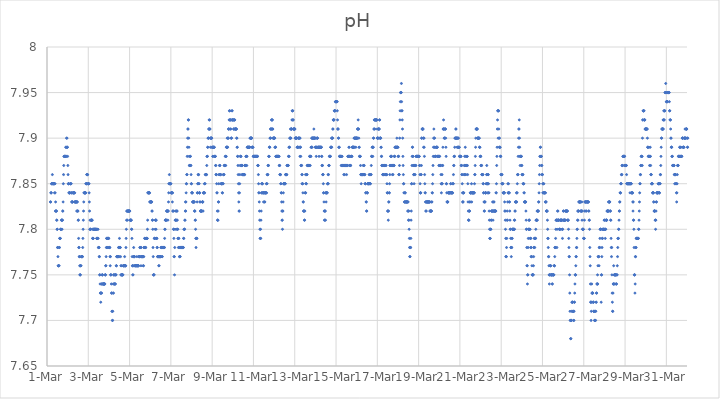
| Category | pH |
|---|---|
| 44986.166666666664 | 7.83 |
| 44986.177083333336 | 7.83 |
| 44986.1875 | 7.84 |
| 44986.197916666664 | 7.84 |
| 44986.208333333336 | 7.84 |
| 44986.21875 | 7.85 |
| 44986.229166666664 | 7.85 |
| 44986.239583333336 | 7.85 |
| 44986.25 | 7.85 |
| 44986.260416666664 | 7.86 |
| 44986.270833333336 | 7.85 |
| 44986.28125 | 7.85 |
| 44986.291666666664 | 7.85 |
| 44986.302083333336 | 7.85 |
| 44986.3125 | 7.85 |
| 44986.322916666664 | 7.85 |
| 44986.333333333336 | 7.85 |
| 44986.34375 | 7.85 |
| 44986.354166666664 | 7.85 |
| 44986.364583333336 | 7.84 |
| 44986.375 | 7.85 |
| 44986.385416666664 | 7.85 |
| 44986.395833333336 | 7.84 |
| 44986.40625 | 7.82 |
| 44986.416666666664 | 7.83 |
| 44986.427083333336 | 7.82 |
| 44986.4375 | 7.82 |
| 44986.447916666664 | 7.82 |
| 44986.458333333336 | 7.82 |
| 44986.46875 | 7.81 |
| 44986.479166666664 | 7.81 |
| 44986.489583333336 | 7.8 |
| 44986.5 | 7.8 |
| 44986.510416666664 | 7.78 |
| 44986.520833333336 | 7.78 |
| 44986.53125 | 7.77 |
| 44986.541666666664 | 7.76 |
| 44986.552083333336 | 7.76 |
| 44986.5625 | 7.76 |
| 44986.572916666664 | 7.76 |
| 44986.583333333336 | 7.76 |
| 44986.59375 | 7.78 |
| 44986.604166666664 | 7.78 |
| 44986.614583333336 | 7.79 |
| 44986.625 | 7.79 |
| 44986.635416666664 | 7.79 |
| 44986.645833333336 | 7.79 |
| 44986.65625 | 7.8 |
| 44986.666666666664 | 7.8 |
| 44986.677083333336 | 7.8 |
| 44986.6875 | 7.8 |
| 44986.697916666664 | 7.81 |
| 44986.708333333336 | 7.81 |
| 44986.71875 | 7.81 |
| 44986.729166666664 | 7.8 |
| 44986.739583333336 | 7.81 |
| 44986.75 | 7.81 |
| 44986.760416666664 | 7.82 |
| 44986.770833333336 | 7.82 |
| 44986.78125 | 7.83 |
| 44986.791666666664 | 7.85 |
| 44986.802083333336 | 7.86 |
| 44986.8125 | 7.87 |
| 44986.822916666664 | 7.88 |
| 44986.833333333336 | 7.88 |
| 44986.84375 | 7.88 |
| 44986.854166666664 | 7.88 |
| 44986.864583333336 | 7.88 |
| 44986.875 | 7.88 |
| 44986.885416666664 | 7.88 |
| 44986.895833333336 | 7.88 |
| 44986.90625 | 7.89 |
| 44986.916666666664 | 7.88 |
| 44986.927083333336 | 7.89 |
| 44986.9375 | 7.88 |
| 44986.947916666664 | 7.9 |
| 44986.958333333336 | 7.89 |
| 44986.96875 | 7.9 |
| 44986.979166666664 | 7.89 |
| 44986.989583333336 | 7.89 |
| 44987.0 | 7.88 |
| 44987.010416666664 | 7.87 |
| 44987.020833333336 | 7.86 |
| 44987.03125 | 7.85 |
| 44987.041666666664 | 7.85 |
| 44987.052083333336 | 7.85 |
| 44987.0625 | 7.84 |
| 44987.072916666664 | 7.84 |
| 44987.083333333336 | 7.84 |
| 44987.09375 | 7.84 |
| 44987.104166666664 | 7.84 |
| 44987.114583333336 | 7.84 |
| 44987.125 | 7.85 |
| 44987.135416666664 | 7.85 |
| 44987.145833333336 | 7.85 |
| 44987.15625 | 7.85 |
| 44987.166666666664 | 7.85 |
| 44987.177083333336 | 7.84 |
| 44987.1875 | 7.84 |
| 44987.197916666664 | 7.83 |
| 44987.208333333336 | 7.83 |
| 44987.21875 | 7.83 |
| 44987.229166666664 | 7.83 |
| 44987.239583333336 | 7.83 |
| 44987.25 | 7.84 |
| 44987.260416666664 | 7.84 |
| 44987.270833333336 | 7.84 |
| 44987.28125 | 7.84 |
| 44987.291666666664 | 7.84 |
| 44987.302083333336 | 7.84 |
| 44987.3125 | 7.84 |
| 44987.322916666664 | 7.84 |
| 44987.333333333336 | 7.83 |
| 44987.34375 | 7.84 |
| 44987.354166666664 | 7.83 |
| 44987.364583333336 | 7.83 |
| 44987.375 | 7.83 |
| 44987.385416666664 | 7.83 |
| 44987.395833333336 | 7.83 |
| 44987.40625 | 7.83 |
| 44987.416666666664 | 7.83 |
| 44987.427083333336 | 7.83 |
| 44987.4375 | 7.82 |
| 44987.447916666664 | 7.83 |
| 44987.458333333336 | 7.83 |
| 44987.46875 | 7.83 |
| 44987.479166666664 | 7.82 |
| 44987.489583333336 | 7.82 |
| 44987.5 | 7.82 |
| 44987.510416666664 | 7.81 |
| 44987.520833333336 | 7.81 |
| 44987.53125 | 7.79 |
| 44987.541666666664 | 7.78 |
| 44987.552083333336 | 7.78 |
| 44987.5625 | 7.77 |
| 44987.572916666664 | 7.77 |
| 44987.583333333336 | 7.76 |
| 44987.59375 | 7.75 |
| 44987.604166666664 | 7.75 |
| 44987.614583333336 | 7.75 |
| 44987.625 | 7.76 |
| 44987.635416666664 | 7.76 |
| 44987.645833333336 | 7.76 |
| 44987.65625 | 7.77 |
| 44987.666666666664 | 7.77 |
| 44987.677083333336 | 7.77 |
| 44987.6875 | 7.77 |
| 44987.697916666664 | 7.77 |
| 44987.708333333336 | 7.77 |
| 44987.71875 | 7.77 |
| 44987.729166666664 | 7.78 |
| 44987.739583333336 | 7.79 |
| 44987.75 | 7.8 |
| 44987.760416666664 | 7.81 |
| 44987.770833333336 | 7.82 |
| 44987.78125 | 7.83 |
| 44987.791666666664 | 7.84 |
| 44987.802083333336 | 7.84 |
| 44987.8125 | 7.84 |
| 44987.822916666664 | 7.84 |
| 44987.833333333336 | 7.84 |
| 44987.84375 | 7.84 |
| 44987.854166666664 | 7.84 |
| 44987.864583333336 | 7.84 |
| 44987.875 | 7.84 |
| 44987.885416666664 | 7.85 |
| 44987.895833333336 | 7.85 |
| 44987.90625 | 7.85 |
| 44987.916666666664 | 7.85 |
| 44987.927083333336 | 7.86 |
| 44987.9375 | 7.86 |
| 44987.947916666664 | 7.86 |
| 44987.958333333336 | 7.86 |
| 44987.96875 | 7.86 |
| 44987.979166666664 | 7.85 |
| 44987.989583333336 | 7.85 |
| 44988.0 | 7.85 |
| 44988.010416666664 | 7.85 |
| 44988.020833333336 | 7.85 |
| 44988.03125 | 7.85 |
| 44988.041666666664 | 7.84 |
| 44988.052083333336 | 7.83 |
| 44988.0625 | 7.82 |
| 44988.072916666664 | 7.8 |
| 44988.083333333336 | 7.81 |
| 44988.09375 | 7.8 |
| 44988.104166666664 | 7.8 |
| 44988.114583333336 | 7.8 |
| 44988.125 | 7.81 |
| 44988.135416666664 | 7.81 |
| 44988.145833333336 | 7.81 |
| 44988.15625 | 7.81 |
| 44988.166666666664 | 7.81 |
| 44988.177083333336 | 7.81 |
| 44988.1875 | 7.81 |
| 44988.197916666664 | 7.8 |
| 44988.208333333336 | 7.79 |
| 44988.21875 | 7.79 |
| 44988.229166666664 | 7.79 |
| 44988.239583333336 | 7.79 |
| 44988.25 | 7.8 |
| 44988.260416666664 | 7.8 |
| 44988.270833333336 | 7.8 |
| 44988.28125 | 7.8 |
| 44988.291666666664 | 7.8 |
| 44988.302083333336 | 7.8 |
| 44988.3125 | 7.8 |
| 44988.322916666664 | 7.8 |
| 44988.333333333336 | 7.8 |
| 44988.34375 | 7.8 |
| 44988.354166666664 | 7.8 |
| 44988.364583333336 | 7.8 |
| 44988.375 | 7.8 |
| 44988.385416666664 | 7.8 |
| 44988.395833333336 | 7.8 |
| 44988.40625 | 7.79 |
| 44988.416666666664 | 7.79 |
| 44988.427083333336 | 7.79 |
| 44988.4375 | 7.79 |
| 44988.447916666664 | 7.79 |
| 44988.458333333336 | 7.8 |
| 44988.46875 | 7.8 |
| 44988.479166666664 | 7.79 |
| 44988.489583333336 | 7.78 |
| 44988.5 | 7.78 |
| 44988.510416666664 | 7.78 |
| 44988.520833333336 | 7.78 |
| 44988.53125 | 7.77 |
| 44988.541666666664 | 7.77 |
| 44988.552083333336 | 7.75 |
| 44988.5625 | 7.75 |
| 44988.572916666664 | 7.74 |
| 44988.583333333336 | 7.73 |
| 44988.59375 | 7.73 |
| 44988.604166666664 | 7.72 |
| 44988.614583333336 | 7.73 |
| 44988.625 | 7.73 |
| 44988.635416666664 | 7.74 |
| 44988.645833333336 | 7.73 |
| 44988.65625 | 7.74 |
| 44988.666666666664 | 7.75 |
| 44988.677083333336 | 7.75 |
| 44988.6875 | 7.75 |
| 44988.697916666664 | 7.74 |
| 44988.708333333336 | 7.74 |
| 44988.71875 | 7.74 |
| 44988.729166666664 | 7.74 |
| 44988.739583333336 | 7.74 |
| 44988.75 | 7.74 |
| 44988.760416666664 | 7.74 |
| 44988.770833333336 | 7.74 |
| 44988.78125 | 7.74 |
| 44988.791666666664 | 7.74 |
| 44988.802083333336 | 7.74 |
| 44988.8125 | 7.75 |
| 44988.822916666664 | 7.75 |
| 44988.833333333336 | 7.75 |
| 44988.84375 | 7.76 |
| 44988.854166666664 | 7.76 |
| 44988.864583333336 | 7.77 |
| 44988.875 | 7.78 |
| 44988.885416666664 | 7.79 |
| 44988.895833333336 | 7.79 |
| 44988.90625 | 7.78 |
| 44988.916666666664 | 7.78 |
| 44988.927083333336 | 7.79 |
| 44988.9375 | 7.79 |
| 44988.947916666664 | 7.79 |
| 44988.958333333336 | 7.79 |
| 44988.96875 | 7.79 |
| 44988.979166666664 | 7.79 |
| 44988.989583333336 | 7.79 |
| 44989.0 | 7.78 |
| 44989.010416666664 | 7.78 |
| 44989.020833333336 | 7.78 |
| 44989.03125 | 7.78 |
| 44989.041666666664 | 7.78 |
| 44989.052083333336 | 7.77 |
| 44989.0625 | 7.76 |
| 44989.072916666664 | 7.77 |
| 44989.083333333336 | 7.75 |
| 44989.09375 | 7.75 |
| 44989.104166666664 | 7.75 |
| 44989.114583333336 | 7.74 |
| 44989.125 | 7.73 |
| 44989.135416666664 | 7.73 |
| 44989.145833333336 | 7.71 |
| 44989.15625 | 7.71 |
| 44989.166666666664 | 7.7 |
| 44989.177083333336 | 7.7 |
| 44989.1875 | 7.71 |
| 44989.197916666664 | 7.73 |
| 44989.208333333336 | 7.74 |
| 44989.21875 | 7.73 |
| 44989.229166666664 | 7.75 |
| 44989.239583333336 | 7.75 |
| 44989.25 | 7.74 |
| 44989.260416666664 | 7.74 |
| 44989.270833333336 | 7.74 |
| 44989.28125 | 7.75 |
| 44989.291666666664 | 7.75 |
| 44989.302083333336 | 7.74 |
| 44989.3125 | 7.74 |
| 44989.322916666664 | 7.75 |
| 44989.333333333336 | 7.75 |
| 44989.34375 | 7.75 |
| 44989.354166666664 | 7.76 |
| 44989.364583333336 | 7.76 |
| 44989.375 | 7.77 |
| 44989.385416666664 | 7.77 |
| 44989.395833333336 | 7.77 |
| 44989.40625 | 7.77 |
| 44989.416666666664 | 7.77 |
| 44989.427083333336 | 7.77 |
| 44989.4375 | 7.77 |
| 44989.447916666664 | 7.77 |
| 44989.458333333336 | 7.77 |
| 44989.46875 | 7.78 |
| 44989.479166666664 | 7.78 |
| 44989.489583333336 | 7.78 |
| 44989.5 | 7.77 |
| 44989.510416666664 | 7.79 |
| 44989.520833333336 | 7.78 |
| 44989.53125 | 7.78 |
| 44989.541666666664 | 7.78 |
| 44989.552083333336 | 7.78 |
| 44989.5625 | 7.77 |
| 44989.572916666664 | 7.75 |
| 44989.583333333336 | 7.76 |
| 44989.59375 | 7.76 |
| 44989.604166666664 | 7.75 |
| 44989.614583333336 | 7.75 |
| 44989.625 | 7.75 |
| 44989.635416666664 | 7.75 |
| 44989.645833333336 | 7.75 |
| 44989.65625 | 7.75 |
| 44989.666666666664 | 7.75 |
| 44989.677083333336 | 7.75 |
| 44989.6875 | 7.76 |
| 44989.697916666664 | 7.76 |
| 44989.708333333336 | 7.76 |
| 44989.71875 | 7.76 |
| 44989.729166666664 | 7.76 |
| 44989.739583333336 | 7.76 |
| 44989.75 | 7.76 |
| 44989.760416666664 | 7.77 |
| 44989.770833333336 | 7.76 |
| 44989.78125 | 7.76 |
| 44989.791666666664 | 7.76 |
| 44989.802083333336 | 7.76 |
| 44989.8125 | 7.76 |
| 44989.822916666664 | 7.78 |
| 44989.833333333336 | 7.79 |
| 44989.84375 | 7.8 |
| 44989.854166666664 | 7.81 |
| 44989.864583333336 | 7.82 |
| 44989.875 | 7.82 |
| 44989.885416666664 | 7.82 |
| 44989.895833333336 | 7.81 |
| 44989.90625 | 7.82 |
| 44989.916666666664 | 7.82 |
| 44989.927083333336 | 7.82 |
| 44989.9375 | 7.82 |
| 44989.947916666664 | 7.82 |
| 44989.958333333336 | 7.82 |
| 44989.96875 | 7.82 |
| 44989.979166666664 | 7.82 |
| 44989.989583333336 | 7.82 |
| 44990.0 | 7.82 |
| 44990.010416666664 | 7.82 |
| 44990.020833333336 | 7.81 |
| 44990.03125 | 7.81 |
| 44990.041666666664 | 7.81 |
| 44990.052083333336 | 7.81 |
| 44990.0625 | 7.81 |
| 44990.072916666664 | 7.81 |
| 44990.083333333336 | 7.81 |
| 44990.09375 | 7.8 |
| 44990.104166666664 | 7.8 |
| 44990.114583333336 | 7.79 |
| 44990.125 | 7.77 |
| 44990.135416666664 | 7.76 |
| 44990.145833333336 | 7.76 |
| 44990.15625 | 7.75 |
| 44990.166666666664 | 7.75 |
| 44990.177083333336 | 7.76 |
| 44990.1875 | 7.77 |
| 44990.197916666664 | 7.78 |
| 44990.208333333336 | 7.77 |
| 44990.21875 | 7.77 |
| 44990.229166666664 | 7.77 |
| 44990.239583333336 | 7.77 |
| 44990.25 | 7.76 |
| 44990.260416666664 | 7.76 |
| 44990.270833333336 | 7.76 |
| 44990.28125 | 7.76 |
| 44990.291666666664 | 7.76 |
| 44990.302083333336 | 7.76 |
| 44990.3125 | 7.76 |
| 44990.322916666664 | 7.76 |
| 44990.333333333336 | 7.76 |
| 44990.34375 | 7.76 |
| 44990.354166666664 | 7.77 |
| 44990.364583333336 | 7.76 |
| 44990.375 | 7.76 |
| 44990.385416666664 | 7.76 |
| 44990.395833333336 | 7.76 |
| 44990.40625 | 7.76 |
| 44990.416666666664 | 7.76 |
| 44990.427083333336 | 7.76 |
| 44990.4375 | 7.76 |
| 44990.447916666664 | 7.77 |
| 44990.458333333336 | 7.77 |
| 44990.46875 | 7.77 |
| 44990.479166666664 | 7.77 |
| 44990.489583333336 | 7.77 |
| 44990.5 | 7.78 |
| 44990.510416666664 | 7.78 |
| 44990.520833333336 | 7.78 |
| 44990.53125 | 7.78 |
| 44990.541666666664 | 7.77 |
| 44990.552083333336 | 7.76 |
| 44990.5625 | 7.78 |
| 44990.572916666664 | 7.77 |
| 44990.583333333336 | 7.77 |
| 44990.59375 | 7.77 |
| 44990.604166666664 | 7.77 |
| 44990.614583333336 | 7.77 |
| 44990.625 | 7.77 |
| 44990.635416666664 | 7.77 |
| 44990.645833333336 | 7.77 |
| 44990.65625 | 7.76 |
| 44990.666666666664 | 7.77 |
| 44990.677083333336 | 7.76 |
| 44990.6875 | 7.77 |
| 44990.697916666664 | 7.78 |
| 44990.708333333336 | 7.78 |
| 44990.71875 | 7.78 |
| 44990.729166666664 | 7.79 |
| 44990.739583333336 | 7.79 |
| 44990.75 | 7.78 |
| 44990.760416666664 | 7.78 |
| 44990.770833333336 | 7.78 |
| 44990.78125 | 7.78 |
| 44990.791666666664 | 7.79 |
| 44990.802083333336 | 7.79 |
| 44990.8125 | 7.79 |
| 44990.822916666664 | 7.79 |
| 44990.833333333336 | 7.79 |
| 44990.84375 | 7.79 |
| 44990.854166666664 | 7.79 |
| 44990.864583333336 | 7.8 |
| 44990.875 | 7.81 |
| 44990.885416666664 | 7.84 |
| 44990.895833333336 | 7.84 |
| 44990.90625 | 7.84 |
| 44990.916666666664 | 7.84 |
| 44990.927083333336 | 7.84 |
| 44990.9375 | 7.84 |
| 44990.947916666664 | 7.84 |
| 44990.958333333336 | 7.84 |
| 44990.96875 | 7.84 |
| 44990.979166666664 | 7.83 |
| 44990.989583333336 | 7.83 |
| 44991.0 | 7.83 |
| 44991.010416666664 | 7.83 |
| 44991.020833333336 | 7.83 |
| 44991.03125 | 7.83 |
| 44991.041666666664 | 7.83 |
| 44991.052083333336 | 7.83 |
| 44991.0625 | 7.83 |
| 44991.072916666664 | 7.83 |
| 44991.083333333336 | 7.82 |
| 44991.09375 | 7.82 |
| 44991.104166666664 | 7.81 |
| 44991.114583333336 | 7.81 |
| 44991.125 | 7.8 |
| 44991.135416666664 | 7.78 |
| 44991.145833333336 | 7.77 |
| 44991.15625 | 7.75 |
| 44991.166666666664 | 7.75 |
| 44991.177083333336 | 7.75 |
| 44991.1875 | 7.75 |
| 44991.197916666664 | 7.79 |
| 44991.208333333336 | 7.79 |
| 44991.21875 | 7.79 |
| 44991.229166666664 | 7.79 |
| 44991.239583333336 | 7.8 |
| 44991.25 | 7.81 |
| 44991.260416666664 | 7.81 |
| 44991.270833333336 | 7.81 |
| 44991.28125 | 7.8 |
| 44991.291666666664 | 7.81 |
| 44991.302083333336 | 7.79 |
| 44991.3125 | 7.79 |
| 44991.322916666664 | 7.79 |
| 44991.333333333336 | 7.78 |
| 44991.34375 | 7.78 |
| 44991.354166666664 | 7.77 |
| 44991.364583333336 | 7.77 |
| 44991.375 | 7.77 |
| 44991.385416666664 | 7.77 |
| 44991.395833333336 | 7.77 |
| 44991.40625 | 7.77 |
| 44991.416666666664 | 7.76 |
| 44991.427083333336 | 7.76 |
| 44991.4375 | 7.77 |
| 44991.447916666664 | 7.77 |
| 44991.458333333336 | 7.77 |
| 44991.46875 | 7.77 |
| 44991.479166666664 | 7.77 |
| 44991.489583333336 | 7.77 |
| 44991.5 | 7.77 |
| 44991.510416666664 | 7.77 |
| 44991.520833333336 | 7.78 |
| 44991.53125 | 7.78 |
| 44991.541666666664 | 7.78 |
| 44991.552083333336 | 7.78 |
| 44991.5625 | 7.78 |
| 44991.572916666664 | 7.77 |
| 44991.583333333336 | 7.77 |
| 44991.59375 | 7.78 |
| 44991.604166666664 | 7.78 |
| 44991.614583333336 | 7.78 |
| 44991.625 | 7.78 |
| 44991.635416666664 | 7.78 |
| 44991.645833333336 | 7.78 |
| 44991.65625 | 7.78 |
| 44991.666666666664 | 7.78 |
| 44991.677083333336 | 7.78 |
| 44991.6875 | 7.78 |
| 44991.697916666664 | 7.79 |
| 44991.708333333336 | 7.8 |
| 44991.71875 | 7.8 |
| 44991.729166666664 | 7.81 |
| 44991.739583333336 | 7.81 |
| 44991.75 | 7.81 |
| 44991.760416666664 | 7.81 |
| 44991.770833333336 | 7.81 |
| 44991.78125 | 7.81 |
| 44991.791666666664 | 7.82 |
| 44991.802083333336 | 7.82 |
| 44991.8125 | 7.82 |
| 44991.822916666664 | 7.82 |
| 44991.833333333336 | 7.82 |
| 44991.84375 | 7.82 |
| 44991.854166666664 | 7.81 |
| 44991.864583333336 | 7.82 |
| 44991.875 | 7.82 |
| 44991.885416666664 | 7.83 |
| 44991.895833333336 | 7.84 |
| 44991.90625 | 7.85 |
| 44991.916666666664 | 7.85 |
| 44991.927083333336 | 7.86 |
| 44991.9375 | 7.85 |
| 44991.947916666664 | 7.85 |
| 44991.958333333336 | 7.85 |
| 44991.96875 | 7.85 |
| 44991.979166666664 | 7.85 |
| 44991.989583333336 | 7.85 |
| 44992.0 | 7.85 |
| 44992.010416666664 | 7.84 |
| 44992.020833333336 | 7.84 |
| 44992.03125 | 7.84 |
| 44992.041666666664 | 7.84 |
| 44992.052083333336 | 7.84 |
| 44992.0625 | 7.84 |
| 44992.072916666664 | 7.83 |
| 44992.083333333336 | 7.84 |
| 44992.09375 | 7.82 |
| 44992.104166666664 | 7.82 |
| 44992.114583333336 | 7.82 |
| 44992.125 | 7.8 |
| 44992.135416666664 | 7.8 |
| 44992.145833333336 | 7.79 |
| 44992.15625 | 7.77 |
| 44992.166666666664 | 7.77 |
| 44992.177083333336 | 7.75 |
| 44992.1875 | 7.78 |
| 44992.197916666664 | 7.8 |
| 44992.208333333336 | 7.81 |
| 44992.21875 | 7.82 |
| 44992.229166666664 | 7.81 |
| 44992.239583333336 | 7.81 |
| 44992.25 | 7.81 |
| 44992.260416666664 | 7.8 |
| 44992.270833333336 | 7.81 |
| 44992.28125 | 7.82 |
| 44992.291666666664 | 7.82 |
| 44992.302083333336 | 7.82 |
| 44992.3125 | 7.81 |
| 44992.322916666664 | 7.8 |
| 44992.333333333336 | 7.8 |
| 44992.34375 | 7.79 |
| 44992.354166666664 | 7.79 |
| 44992.364583333336 | 7.78 |
| 44992.375 | 7.79 |
| 44992.385416666664 | 7.79 |
| 44992.395833333336 | 7.78 |
| 44992.40625 | 7.78 |
| 44992.416666666664 | 7.77 |
| 44992.427083333336 | 7.77 |
| 44992.4375 | 7.77 |
| 44992.447916666664 | 7.77 |
| 44992.458333333336 | 7.78 |
| 44992.46875 | 7.78 |
| 44992.479166666664 | 7.78 |
| 44992.489583333336 | 7.78 |
| 44992.5 | 7.78 |
| 44992.510416666664 | 7.78 |
| 44992.520833333336 | 7.78 |
| 44992.53125 | 7.78 |
| 44992.541666666664 | 7.78 |
| 44992.552083333336 | 7.78 |
| 44992.5625 | 7.78 |
| 44992.572916666664 | 7.78 |
| 44992.583333333336 | 7.78 |
| 44992.59375 | 7.78 |
| 44992.604166666664 | 7.78 |
| 44992.614583333336 | 7.79 |
| 44992.625 | 7.79 |
| 44992.635416666664 | 7.8 |
| 44992.645833333336 | 7.8 |
| 44992.65625 | 7.8 |
| 44992.666666666664 | 7.8 |
| 44992.677083333336 | 7.81 |
| 44992.6875 | 7.81 |
| 44992.697916666664 | 7.82 |
| 44992.708333333336 | 7.83 |
| 44992.71875 | 7.82 |
| 44992.729166666664 | 7.83 |
| 44992.739583333336 | 7.84 |
| 44992.75 | 7.85 |
| 44992.760416666664 | 7.85 |
| 44992.770833333336 | 7.86 |
| 44992.78125 | 7.86 |
| 44992.791666666664 | 7.88 |
| 44992.802083333336 | 7.89 |
| 44992.8125 | 7.9 |
| 44992.822916666664 | 7.91 |
| 44992.833333333336 | 7.91 |
| 44992.84375 | 7.92 |
| 44992.854166666664 | 7.92 |
| 44992.864583333336 | 7.9 |
| 44992.875 | 7.89 |
| 44992.885416666664 | 7.88 |
| 44992.895833333336 | 7.87 |
| 44992.90625 | 7.87 |
| 44992.916666666664 | 7.87 |
| 44992.927083333336 | 7.87 |
| 44992.9375 | 7.88 |
| 44992.947916666664 | 7.88 |
| 44992.958333333336 | 7.87 |
| 44992.96875 | 7.87 |
| 44992.979166666664 | 7.86 |
| 44992.989583333336 | 7.85 |
| 44993.0 | 7.85 |
| 44993.010416666664 | 7.84 |
| 44993.020833333336 | 7.84 |
| 44993.03125 | 7.84 |
| 44993.041666666664 | 7.84 |
| 44993.052083333336 | 7.83 |
| 44993.0625 | 7.83 |
| 44993.072916666664 | 7.83 |
| 44993.083333333336 | 7.83 |
| 44993.09375 | 7.83 |
| 44993.104166666664 | 7.83 |
| 44993.114583333336 | 7.83 |
| 44993.125 | 7.83 |
| 44993.135416666664 | 7.83 |
| 44993.145833333336 | 7.82 |
| 44993.15625 | 7.82 |
| 44993.166666666664 | 7.82 |
| 44993.177083333336 | 7.81 |
| 44993.1875 | 7.81 |
| 44993.197916666664 | 7.8 |
| 44993.208333333336 | 7.79 |
| 44993.21875 | 7.78 |
| 44993.229166666664 | 7.79 |
| 44993.239583333336 | 7.79 |
| 44993.25 | 7.79 |
| 44993.260416666664 | 7.79 |
| 44993.270833333336 | 7.83 |
| 44993.28125 | 7.84 |
| 44993.291666666664 | 7.84 |
| 44993.302083333336 | 7.85 |
| 44993.3125 | 7.85 |
| 44993.322916666664 | 7.86 |
| 44993.333333333336 | 7.86 |
| 44993.34375 | 7.86 |
| 44993.354166666664 | 7.85 |
| 44993.364583333336 | 7.85 |
| 44993.375 | 7.84 |
| 44993.385416666664 | 7.84 |
| 44993.395833333336 | 7.84 |
| 44993.40625 | 7.83 |
| 44993.416666666664 | 7.83 |
| 44993.427083333336 | 7.82 |
| 44993.4375 | 7.82 |
| 44993.447916666664 | 7.82 |
| 44993.458333333336 | 7.82 |
| 44993.46875 | 7.82 |
| 44993.479166666664 | 7.82 |
| 44993.489583333336 | 7.82 |
| 44993.5 | 7.82 |
| 44993.510416666664 | 7.82 |
| 44993.520833333336 | 7.83 |
| 44993.53125 | 7.83 |
| 44993.541666666664 | 7.83 |
| 44993.552083333336 | 7.83 |
| 44993.5625 | 7.82 |
| 44993.572916666664 | 7.84 |
| 44993.583333333336 | 7.84 |
| 44993.59375 | 7.84 |
| 44993.604166666664 | 7.84 |
| 44993.614583333336 | 7.84 |
| 44993.625 | 7.85 |
| 44993.635416666664 | 7.84 |
| 44993.645833333336 | 7.85 |
| 44993.65625 | 7.85 |
| 44993.666666666664 | 7.86 |
| 44993.677083333336 | 7.86 |
| 44993.6875 | 7.86 |
| 44993.697916666664 | 7.86 |
| 44993.708333333336 | 7.86 |
| 44993.71875 | 7.86 |
| 44993.729166666664 | 7.86 |
| 44993.739583333336 | 7.87 |
| 44993.75 | 7.88 |
| 44993.760416666664 | 7.88 |
| 44993.770833333336 | 7.88 |
| 44993.78125 | 7.89 |
| 44993.791666666664 | 7.89 |
| 44993.802083333336 | 7.9 |
| 44993.8125 | 7.9 |
| 44993.822916666664 | 7.9 |
| 44993.833333333336 | 7.91 |
| 44993.84375 | 7.91 |
| 44993.854166666664 | 7.92 |
| 44993.864583333336 | 7.91 |
| 44993.875 | 7.92 |
| 44993.885416666664 | 7.91 |
| 44993.895833333336 | 7.91 |
| 44993.90625 | 7.9 |
| 44993.916666666664 | 7.89 |
| 44993.927083333336 | 7.9 |
| 44993.9375 | 7.9 |
| 44993.947916666664 | 7.9 |
| 44993.958333333336 | 7.9 |
| 44993.96875 | 7.9 |
| 44993.979166666664 | 7.9 |
| 44993.989583333336 | 7.89 |
| 44994.0 | 7.89 |
| 44994.010416666664 | 7.89 |
| 44994.020833333336 | 7.89 |
| 44994.03125 | 7.88 |
| 44994.041666666664 | 7.88 |
| 44994.052083333336 | 7.89 |
| 44994.0625 | 7.89 |
| 44994.072916666664 | 7.89 |
| 44994.083333333336 | 7.89 |
| 44994.09375 | 7.89 |
| 44994.104166666664 | 7.89 |
| 44994.114583333336 | 7.88 |
| 44994.125 | 7.88 |
| 44994.135416666664 | 7.88 |
| 44994.145833333336 | 7.88 |
| 44994.15625 | 7.88 |
| 44994.166666666664 | 7.87 |
| 44994.177083333336 | 7.87 |
| 44994.1875 | 7.86 |
| 44994.197916666664 | 7.86 |
| 44994.208333333336 | 7.86 |
| 44994.21875 | 7.85 |
| 44994.229166666664 | 7.84 |
| 44994.239583333336 | 7.84 |
| 44994.25 | 7.82 |
| 44994.260416666664 | 7.81 |
| 44994.270833333336 | 7.81 |
| 44994.28125 | 7.81 |
| 44994.291666666664 | 7.82 |
| 44994.302083333336 | 7.83 |
| 44994.3125 | 7.83 |
| 44994.322916666664 | 7.85 |
| 44994.333333333336 | 7.86 |
| 44994.34375 | 7.86 |
| 44994.354166666664 | 7.87 |
| 44994.364583333336 | 7.87 |
| 44994.375 | 7.87 |
| 44994.385416666664 | 7.86 |
| 44994.395833333336 | 7.86 |
| 44994.40625 | 7.86 |
| 44994.416666666664 | 7.86 |
| 44994.427083333336 | 7.85 |
| 44994.4375 | 7.85 |
| 44994.447916666664 | 7.85 |
| 44994.458333333336 | 7.85 |
| 44994.46875 | 7.85 |
| 44994.479166666664 | 7.85 |
| 44994.489583333336 | 7.84 |
| 44994.5 | 7.84 |
| 44994.510416666664 | 7.85 |
| 44994.520833333336 | 7.85 |
| 44994.53125 | 7.85 |
| 44994.541666666664 | 7.86 |
| 44994.552083333336 | 7.86 |
| 44994.5625 | 7.86 |
| 44994.572916666664 | 7.86 |
| 44994.583333333336 | 7.87 |
| 44994.59375 | 7.87 |
| 44994.604166666664 | 7.87 |
| 44994.614583333336 | 7.87 |
| 44994.625 | 7.87 |
| 44994.635416666664 | 7.88 |
| 44994.645833333336 | 7.88 |
| 44994.65625 | 7.87 |
| 44994.666666666664 | 7.88 |
| 44994.677083333336 | 7.88 |
| 44994.6875 | 7.89 |
| 44994.697916666664 | 7.89 |
| 44994.708333333336 | 7.89 |
| 44994.71875 | 7.89 |
| 44994.729166666664 | 7.9 |
| 44994.739583333336 | 7.89 |
| 44994.75 | 7.89 |
| 44994.760416666664 | 7.9 |
| 44994.770833333336 | 7.9 |
| 44994.78125 | 7.9 |
| 44994.791666666664 | 7.91 |
| 44994.802083333336 | 7.91 |
| 44994.8125 | 7.91 |
| 44994.822916666664 | 7.92 |
| 44994.833333333336 | 7.93 |
| 44994.84375 | 7.92 |
| 44994.854166666664 | 7.93 |
| 44994.864583333336 | 7.92 |
| 44994.875 | 7.91 |
| 44994.885416666664 | 7.92 |
| 44994.895833333336 | 7.92 |
| 44994.90625 | 7.91 |
| 44994.916666666664 | 7.9 |
| 44994.927083333336 | 7.9 |
| 44994.9375 | 7.9 |
| 44994.947916666664 | 7.92 |
| 44994.958333333336 | 7.93 |
| 44994.96875 | 7.93 |
| 44994.979166666664 | 7.92 |
| 44994.989583333336 | 7.92 |
| 44995.0 | 7.92 |
| 44995.010416666664 | 7.92 |
| 44995.020833333336 | 7.92 |
| 44995.03125 | 7.92 |
| 44995.041666666664 | 7.91 |
| 44995.052083333336 | 7.91 |
| 44995.0625 | 7.91 |
| 44995.072916666664 | 7.92 |
| 44995.083333333336 | 7.92 |
| 44995.09375 | 7.92 |
| 44995.104166666664 | 7.91 |
| 44995.114583333336 | 7.91 |
| 44995.125 | 7.91 |
| 44995.135416666664 | 7.91 |
| 44995.145833333336 | 7.91 |
| 44995.15625 | 7.91 |
| 44995.166666666664 | 7.91 |
| 44995.177083333336 | 7.91 |
| 44995.1875 | 7.9 |
| 44995.197916666664 | 7.9 |
| 44995.208333333336 | 7.89 |
| 44995.21875 | 7.89 |
| 44995.229166666664 | 7.88 |
| 44995.239583333336 | 7.88 |
| 44995.25 | 7.87 |
| 44995.260416666664 | 7.86 |
| 44995.270833333336 | 7.85 |
| 44995.28125 | 7.84 |
| 44995.291666666664 | 7.83 |
| 44995.302083333336 | 7.82 |
| 44995.3125 | 7.82 |
| 44995.322916666664 | 7.84 |
| 44995.333333333336 | 7.85 |
| 44995.34375 | 7.86 |
| 44995.354166666664 | 7.87 |
| 44995.364583333336 | 7.88 |
| 44995.375 | 7.88 |
| 44995.385416666664 | 7.88 |
| 44995.395833333336 | 7.88 |
| 44995.40625 | 7.87 |
| 44995.416666666664 | 7.87 |
| 44995.427083333336 | 7.87 |
| 44995.4375 | 7.87 |
| 44995.447916666664 | 7.86 |
| 44995.458333333336 | 7.87 |
| 44995.46875 | 7.86 |
| 44995.479166666664 | 7.86 |
| 44995.489583333336 | 7.86 |
| 44995.5 | 7.86 |
| 44995.510416666664 | 7.86 |
| 44995.520833333336 | 7.86 |
| 44995.53125 | 7.86 |
| 44995.541666666664 | 7.86 |
| 44995.552083333336 | 7.86 |
| 44995.5625 | 7.86 |
| 44995.572916666664 | 7.86 |
| 44995.583333333336 | 7.87 |
| 44995.59375 | 7.87 |
| 44995.604166666664 | 7.87 |
| 44995.614583333336 | 7.87 |
| 44995.625 | 7.87 |
| 44995.635416666664 | 7.88 |
| 44995.645833333336 | 7.88 |
| 44995.65625 | 7.88 |
| 44995.666666666664 | 7.88 |
| 44995.677083333336 | 7.87 |
| 44995.6875 | 7.88 |
| 44995.697916666664 | 7.89 |
| 44995.708333333336 | 7.89 |
| 44995.71875 | 7.89 |
| 44995.729166666664 | 7.89 |
| 44995.739583333336 | 7.89 |
| 44995.75 | 7.89 |
| 44995.760416666664 | 7.89 |
| 44995.770833333336 | 7.89 |
| 44995.78125 | 7.89 |
| 44995.791666666664 | 7.89 |
| 44995.802083333336 | 7.89 |
| 44995.8125 | 7.89 |
| 44995.822916666664 | 7.89 |
| 44995.833333333336 | 7.9 |
| 44995.84375 | 7.9 |
| 44995.854166666664 | 7.9 |
| 44995.864583333336 | 7.9 |
| 44995.875 | 7.9 |
| 44995.885416666664 | 7.9 |
| 44995.895833333336 | 7.9 |
| 44995.90625 | 7.9 |
| 44995.916666666664 | 7.9 |
| 44995.927083333336 | 7.89 |
| 44995.9375 | 7.89 |
| 44995.947916666664 | 7.89 |
| 44995.958333333336 | 7.89 |
| 44995.96875 | 7.89 |
| 44995.979166666664 | 7.89 |
| 44995.989583333336 | 7.88 |
| 44996.0 | 7.88 |
| 44996.010416666664 | 7.88 |
| 44996.020833333336 | 7.88 |
| 44996.03125 | 7.88 |
| 44996.041666666664 | 7.88 |
| 44996.052083333336 | 7.88 |
| 44996.0625 | 7.88 |
| 44996.072916666664 | 7.88 |
| 44996.083333333336 | 7.88 |
| 44996.09375 | 7.88 |
| 44996.104166666664 | 7.88 |
| 44996.114583333336 | 7.88 |
| 44996.125 | 7.88 |
| 44996.135416666664 | 7.88 |
| 44996.145833333336 | 7.88 |
| 44996.15625 | 7.88 |
| 44996.166666666664 | 7.88 |
| 44996.177083333336 | 7.88 |
| 44996.1875 | 7.88 |
| 44996.197916666664 | 7.88 |
| 44996.208333333336 | 7.87 |
| 44996.21875 | 7.87 |
| 44996.229166666664 | 7.87 |
| 44996.239583333336 | 7.86 |
| 44996.25 | 7.85 |
| 44996.260416666664 | 7.84 |
| 44996.270833333336 | 7.84 |
| 44996.28125 | 7.83 |
| 44996.291666666664 | 7.82 |
| 44996.302083333336 | 7.81 |
| 44996.3125 | 7.8 |
| 44996.322916666664 | 7.79 |
| 44996.333333333336 | 7.79 |
| 44996.34375 | 7.8 |
| 44996.354166666664 | 7.79 |
| 44996.364583333336 | 7.81 |
| 44996.375 | 7.82 |
| 44996.385416666664 | 7.84 |
| 44996.395833333336 | 7.85 |
| 44996.40625 | 7.84 |
| 44996.416666666664 | 7.85 |
| 44996.427083333336 | 7.85 |
| 44996.4375 | 7.85 |
| 44996.447916666664 | 7.84 |
| 44996.458333333336 | 7.84 |
| 44996.46875 | 7.84 |
| 44996.479166666664 | 7.84 |
| 44996.489583333336 | 7.83 |
| 44996.5 | 7.84 |
| 44996.510416666664 | 7.84 |
| 44996.520833333336 | 7.84 |
| 44996.53125 | 7.84 |
| 44996.541666666664 | 7.83 |
| 44996.552083333336 | 7.83 |
| 44996.5625 | 7.84 |
| 44996.572916666664 | 7.84 |
| 44996.583333333336 | 7.84 |
| 44996.59375 | 7.84 |
| 44996.604166666664 | 7.84 |
| 44996.614583333336 | 7.84 |
| 44996.625 | 7.85 |
| 44996.635416666664 | 7.84 |
| 44996.645833333336 | 7.85 |
| 44996.65625 | 7.85 |
| 44996.666666666664 | 7.86 |
| 44996.677083333336 | 7.86 |
| 44996.6875 | 7.86 |
| 44996.697916666664 | 7.86 |
| 44996.708333333336 | 7.87 |
| 44996.71875 | 7.87 |
| 44996.729166666664 | 7.87 |
| 44996.739583333336 | 7.88 |
| 44996.75 | 7.88 |
| 44996.760416666664 | 7.88 |
| 44996.770833333336 | 7.89 |
| 44996.78125 | 7.89 |
| 44996.791666666664 | 7.89 |
| 44996.802083333336 | 7.9 |
| 44996.8125 | 7.9 |
| 44996.822916666664 | 7.91 |
| 44996.833333333336 | 7.9 |
| 44996.84375 | 7.91 |
| 44996.854166666664 | 7.91 |
| 44996.864583333336 | 7.91 |
| 44996.875 | 7.92 |
| 44996.885416666664 | 7.92 |
| 44996.895833333336 | 7.91 |
| 44996.90625 | 7.92 |
| 44996.916666666664 | 7.92 |
| 44996.927083333336 | 7.91 |
| 44996.9375 | 7.91 |
| 44996.947916666664 | 7.9 |
| 44996.958333333336 | 7.9 |
| 44996.96875 | 7.9 |
| 44996.979166666664 | 7.9 |
| 44996.989583333336 | 7.9 |
| 44997.0 | 7.9 |
| 44997.010416666664 | 7.9 |
| 44997.020833333336 | 7.9 |
| 44997.03125 | 7.9 |
| 44997.041666666664 | 7.89 |
| 44997.052083333336 | 7.89 |
| 44997.0625 | 7.89 |
| 44997.072916666664 | 7.89 |
| 44997.083333333336 | 7.88 |
| 44997.09375 | 7.88 |
| 44997.104166666664 | 7.88 |
| 44997.114583333336 | 7.88 |
| 44997.125 | 7.88 |
| 44997.135416666664 | 7.88 |
| 44997.145833333336 | 7.88 |
| 44997.15625 | 7.88 |
| 44997.166666666664 | 7.88 |
| 44997.177083333336 | 7.88 |
| 44997.1875 | 7.88 |
| 44997.197916666664 | 7.88 |
| 44997.208333333336 | 7.88 |
| 44997.21875 | 7.88 |
| 44997.229166666664 | 7.88 |
| 44997.239583333336 | 7.88 |
| 44997.25 | 7.87 |
| 44997.260416666664 | 7.87 |
| 44997.270833333336 | 7.87 |
| 44997.28125 | 7.86 |
| 44997.291666666664 | 7.86 |
| 44997.302083333336 | 7.86 |
| 44997.3125 | 7.86 |
| 44997.322916666664 | 7.85 |
| 44997.333333333336 | 7.85 |
| 44997.34375 | 7.84 |
| 44997.354166666664 | 7.84 |
| 44997.364583333336 | 7.83 |
| 44997.375 | 7.82 |
| 44997.385416666664 | 7.81 |
| 44997.395833333336 | 7.81 |
| 44997.40625 | 7.8 |
| 44997.416666666664 | 7.82 |
| 44997.427083333336 | 7.82 |
| 44997.4375 | 7.83 |
| 44997.447916666664 | 7.84 |
| 44997.458333333336 | 7.85 |
| 44997.46875 | 7.85 |
| 44997.479166666664 | 7.85 |
| 44997.489583333336 | 7.85 |
| 44997.5 | 7.85 |
| 44997.510416666664 | 7.85 |
| 44997.520833333336 | 7.85 |
| 44997.53125 | 7.85 |
| 44997.541666666664 | 7.85 |
| 44997.552083333336 | 7.86 |
| 44997.5625 | 7.86 |
| 44997.572916666664 | 7.86 |
| 44997.583333333336 | 7.86 |
| 44997.59375 | 7.86 |
| 44997.604166666664 | 7.86 |
| 44997.614583333336 | 7.86 |
| 44997.625 | 7.87 |
| 44997.635416666664 | 7.87 |
| 44997.645833333336 | 7.87 |
| 44997.65625 | 7.87 |
| 44997.666666666664 | 7.87 |
| 44997.677083333336 | 7.87 |
| 44997.6875 | 7.87 |
| 44997.697916666664 | 7.88 |
| 44997.708333333336 | 7.88 |
| 44997.71875 | 7.89 |
| 44997.729166666664 | 7.88 |
| 44997.739583333336 | 7.89 |
| 44997.75 | 7.89 |
| 44997.760416666664 | 7.9 |
| 44997.770833333336 | 7.9 |
| 44997.78125 | 7.9 |
| 44997.791666666664 | 7.91 |
| 44997.802083333336 | 7.9 |
| 44997.8125 | 7.9 |
| 44997.822916666664 | 7.91 |
| 44997.833333333336 | 7.91 |
| 44997.84375 | 7.91 |
| 44997.854166666664 | 7.91 |
| 44997.864583333336 | 7.92 |
| 44997.875 | 7.93 |
| 44997.885416666664 | 7.92 |
| 44997.895833333336 | 7.93 |
| 44997.90625 | 7.93 |
| 44997.916666666664 | 7.92 |
| 44997.927083333336 | 7.92 |
| 44997.9375 | 7.91 |
| 44997.947916666664 | 7.91 |
| 44997.958333333336 | 7.91 |
| 44997.96875 | 7.91 |
| 44997.979166666664 | 7.91 |
| 44997.989583333336 | 7.91 |
| 44998.0 | 7.91 |
| 44998.010416666664 | 7.91 |
| 44998.020833333336 | 7.9 |
| 44998.03125 | 7.9 |
| 44998.041666666664 | 7.9 |
| 44998.052083333336 | 7.9 |
| 44998.0625 | 7.9 |
| 44998.072916666664 | 7.9 |
| 44998.083333333336 | 7.9 |
| 44998.09375 | 7.9 |
| 44998.104166666664 | 7.9 |
| 44998.114583333336 | 7.89 |
| 44998.125 | 7.89 |
| 44998.135416666664 | 7.89 |
| 44998.145833333336 | 7.89 |
| 44998.15625 | 7.89 |
| 44998.166666666664 | 7.89 |
| 44998.177083333336 | 7.9 |
| 44998.1875 | 7.9 |
| 44998.197916666664 | 7.9 |
| 44998.208333333336 | 7.9 |
| 44998.21875 | 7.9 |
| 44998.229166666664 | 7.9 |
| 44998.239583333336 | 7.89 |
| 44998.25 | 7.88 |
| 44998.260416666664 | 7.9 |
| 44998.270833333336 | 7.89 |
| 44998.28125 | 7.89 |
| 44998.291666666664 | 7.88 |
| 44998.302083333336 | 7.87 |
| 44998.3125 | 7.87 |
| 44998.322916666664 | 7.87 |
| 44998.333333333336 | 7.87 |
| 44998.34375 | 7.86 |
| 44998.354166666664 | 7.85 |
| 44998.364583333336 | 7.86 |
| 44998.375 | 7.85 |
| 44998.385416666664 | 7.85 |
| 44998.395833333336 | 7.84 |
| 44998.40625 | 7.83 |
| 44998.416666666664 | 7.83 |
| 44998.427083333336 | 7.82 |
| 44998.4375 | 7.82 |
| 44998.447916666664 | 7.82 |
| 44998.458333333336 | 7.82 |
| 44998.46875 | 7.81 |
| 44998.479166666664 | 7.81 |
| 44998.489583333336 | 7.82 |
| 44998.5 | 7.84 |
| 44998.510416666664 | 7.84 |
| 44998.520833333336 | 7.86 |
| 44998.53125 | 7.84 |
| 44998.541666666664 | 7.85 |
| 44998.552083333336 | 7.85 |
| 44998.5625 | 7.85 |
| 44998.572916666664 | 7.86 |
| 44998.583333333336 | 7.86 |
| 44998.59375 | 7.86 |
| 44998.604166666664 | 7.87 |
| 44998.614583333336 | 7.87 |
| 44998.625 | 7.87 |
| 44998.635416666664 | 7.87 |
| 44998.645833333336 | 7.87 |
| 44998.65625 | 7.87 |
| 44998.666666666664 | 7.87 |
| 44998.677083333336 | 7.87 |
| 44998.6875 | 7.87 |
| 44998.697916666664 | 7.87 |
| 44998.708333333336 | 7.87 |
| 44998.71875 | 7.88 |
| 44998.729166666664 | 7.88 |
| 44998.739583333336 | 7.88 |
| 44998.75 | 7.87 |
| 44998.760416666664 | 7.88 |
| 44998.770833333336 | 7.88 |
| 44998.78125 | 7.88 |
| 44998.791666666664 | 7.89 |
| 44998.802083333336 | 7.89 |
| 44998.8125 | 7.89 |
| 44998.822916666664 | 7.9 |
| 44998.833333333336 | 7.9 |
| 44998.84375 | 7.89 |
| 44998.854166666664 | 7.9 |
| 44998.864583333336 | 7.9 |
| 44998.875 | 7.9 |
| 44998.885416666664 | 7.9 |
| 44998.895833333336 | 7.9 |
| 44998.90625 | 7.9 |
| 44998.916666666664 | 7.9 |
| 44998.927083333336 | 7.91 |
| 44998.9375 | 7.9 |
| 44998.947916666664 | 7.9 |
| 44998.958333333336 | 7.9 |
| 44998.96875 | 7.9 |
| 44998.979166666664 | 7.9 |
| 44998.989583333336 | 7.89 |
| 44999.0 | 7.9 |
| 44999.010416666664 | 7.89 |
| 44999.020833333336 | 7.89 |
| 44999.03125 | 7.89 |
| 44999.041666666664 | 7.88 |
| 44999.052083333336 | 7.89 |
| 44999.0625 | 7.89 |
| 44999.072916666664 | 7.9 |
| 44999.083333333336 | 7.9 |
| 44999.09375 | 7.9 |
| 44999.104166666664 | 7.9 |
| 44999.114583333336 | 7.89 |
| 44999.125 | 7.89 |
| 44999.135416666664 | 7.89 |
| 44999.145833333336 | 7.89 |
| 44999.15625 | 7.89 |
| 44999.166666666664 | 7.89 |
| 44999.177083333336 | 7.88 |
| 44999.1875 | 7.89 |
| 44999.197916666664 | 7.89 |
| 44999.208333333336 | 7.89 |
| 44999.21875 | 7.89 |
| 44999.229166666664 | 7.89 |
| 44999.239583333336 | 7.89 |
| 44999.25 | 7.89 |
| 44999.260416666664 | 7.89 |
| 44999.270833333336 | 7.89 |
| 44999.28125 | 7.89 |
| 44999.291666666664 | 7.89 |
| 44999.302083333336 | 7.88 |
| 44999.3125 | 7.88 |
| 44999.322916666664 | 7.87 |
| 44999.333333333336 | 7.87 |
| 44999.34375 | 7.87 |
| 44999.354166666664 | 7.86 |
| 44999.364583333336 | 7.86 |
| 44999.375 | 7.86 |
| 44999.385416666664 | 7.85 |
| 44999.395833333336 | 7.84 |
| 44999.40625 | 7.84 |
| 44999.416666666664 | 7.83 |
| 44999.427083333336 | 7.82 |
| 44999.4375 | 7.81 |
| 44999.447916666664 | 7.82 |
| 44999.458333333336 | 7.81 |
| 44999.46875 | 7.82 |
| 44999.479166666664 | 7.82 |
| 44999.489583333336 | 7.81 |
| 44999.5 | 7.84 |
| 44999.510416666664 | 7.84 |
| 44999.520833333336 | 7.83 |
| 44999.53125 | 7.84 |
| 44999.541666666664 | 7.84 |
| 44999.552083333336 | 7.84 |
| 44999.5625 | 7.84 |
| 44999.572916666664 | 7.84 |
| 44999.583333333336 | 7.85 |
| 44999.59375 | 7.85 |
| 44999.604166666664 | 7.85 |
| 44999.614583333336 | 7.86 |
| 44999.625 | 7.85 |
| 44999.635416666664 | 7.86 |
| 44999.645833333336 | 7.87 |
| 44999.65625 | 7.87 |
| 44999.666666666664 | 7.87 |
| 44999.677083333336 | 7.88 |
| 44999.6875 | 7.88 |
| 44999.697916666664 | 7.88 |
| 44999.708333333336 | 7.88 |
| 44999.71875 | 7.88 |
| 44999.729166666664 | 7.88 |
| 44999.739583333336 | 7.89 |
| 44999.75 | 7.89 |
| 44999.760416666664 | 7.89 |
| 44999.770833333336 | 7.89 |
| 44999.78125 | 7.9 |
| 44999.791666666664 | 7.89 |
| 44999.802083333336 | 7.9 |
| 44999.8125 | 7.9 |
| 44999.822916666664 | 7.9 |
| 44999.833333333336 | 7.9 |
| 44999.84375 | 7.91 |
| 44999.854166666664 | 7.91 |
| 44999.864583333336 | 7.92 |
| 44999.875 | 7.92 |
| 44999.885416666664 | 7.92 |
| 44999.895833333336 | 7.92 |
| 44999.90625 | 7.92 |
| 44999.916666666664 | 7.93 |
| 44999.927083333336 | 7.93 |
| 44999.9375 | 7.93 |
| 44999.947916666664 | 7.93 |
| 44999.958333333336 | 7.93 |
| 44999.96875 | 7.94 |
| 44999.979166666664 | 7.94 |
| 44999.989583333336 | 7.94 |
| 45000.0 | 7.94 |
| 45000.010416666664 | 7.94 |
| 45000.020833333336 | 7.94 |
| 45000.03125 | 7.94 |
| 45000.041666666664 | 7.94 |
| 45000.052083333336 | 7.94 |
| 45000.0625 | 7.93 |
| 45000.072916666664 | 7.92 |
| 45000.083333333336 | 7.91 |
| 45000.09375 | 7.91 |
| 45000.104166666664 | 7.91 |
| 45000.114583333336 | 7.9 |
| 45000.125 | 7.9 |
| 45000.135416666664 | 7.89 |
| 45000.145833333336 | 7.89 |
| 45000.15625 | 7.89 |
| 45000.166666666664 | 7.88 |
| 45000.177083333336 | 7.88 |
| 45000.1875 | 7.88 |
| 45000.197916666664 | 7.88 |
| 45000.208333333336 | 7.88 |
| 45000.21875 | 7.88 |
| 45000.229166666664 | 7.88 |
| 45000.239583333336 | 7.88 |
| 45000.25 | 7.87 |
| 45000.260416666664 | 7.88 |
| 45000.270833333336 | 7.87 |
| 45000.28125 | 7.88 |
| 45000.291666666664 | 7.88 |
| 45000.302083333336 | 7.87 |
| 45000.3125 | 7.87 |
| 45000.322916666664 | 7.87 |
| 45000.333333333336 | 7.87 |
| 45000.34375 | 7.87 |
| 45000.354166666664 | 7.87 |
| 45000.364583333336 | 7.87 |
| 45000.375 | 7.86 |
| 45000.385416666664 | 7.87 |
| 45000.395833333336 | 7.87 |
| 45000.40625 | 7.87 |
| 45000.416666666664 | 7.86 |
| 45000.427083333336 | 7.87 |
| 45000.4375 | 7.87 |
| 45000.447916666664 | 7.87 |
| 45000.458333333336 | 7.87 |
| 45000.46875 | 7.87 |
| 45000.479166666664 | 7.87 |
| 45000.489583333336 | 7.87 |
| 45000.5 | 7.87 |
| 45000.510416666664 | 7.86 |
| 45000.520833333336 | 7.87 |
| 45000.53125 | 7.87 |
| 45000.541666666664 | 7.87 |
| 45000.552083333336 | 7.87 |
| 45000.5625 | 7.87 |
| 45000.572916666664 | 7.88 |
| 45000.583333333336 | 7.88 |
| 45000.59375 | 7.88 |
| 45000.604166666664 | 7.88 |
| 45000.614583333336 | 7.88 |
| 45000.625 | 7.89 |
| 45000.635416666664 | 7.89 |
| 45000.645833333336 | 7.88 |
| 45000.65625 | 7.88 |
| 45000.666666666664 | 7.87 |
| 45000.677083333336 | 7.87 |
| 45000.6875 | 7.87 |
| 45000.697916666664 | 7.87 |
| 45000.708333333336 | 7.87 |
| 45000.71875 | 7.88 |
| 45000.729166666664 | 7.88 |
| 45000.739583333336 | 7.88 |
| 45000.75 | 7.88 |
| 45000.760416666664 | 7.88 |
| 45000.770833333336 | 7.88 |
| 45000.78125 | 7.89 |
| 45000.791666666664 | 7.89 |
| 45000.802083333336 | 7.89 |
| 45000.8125 | 7.89 |
| 45000.822916666664 | 7.89 |
| 45000.833333333336 | 7.89 |
| 45000.84375 | 7.89 |
| 45000.854166666664 | 7.89 |
| 45000.864583333336 | 7.89 |
| 45000.875 | 7.9 |
| 45000.885416666664 | 7.9 |
| 45000.895833333336 | 7.89 |
| 45000.90625 | 7.9 |
| 45000.916666666664 | 7.9 |
| 45000.927083333336 | 7.9 |
| 45000.9375 | 7.9 |
| 45000.947916666664 | 7.9 |
| 45000.958333333336 | 7.89 |
| 45000.96875 | 7.9 |
| 45000.979166666664 | 7.9 |
| 45000.989583333336 | 7.9 |
| 45001.0 | 7.9 |
| 45001.010416666664 | 7.9 |
| 45001.020833333336 | 7.9 |
| 45001.03125 | 7.9 |
| 45001.041666666664 | 7.91 |
| 45001.052083333336 | 7.91 |
| 45001.0625 | 7.91 |
| 45001.072916666664 | 7.92 |
| 45001.083333333336 | 7.91 |
| 45001.09375 | 7.91 |
| 45001.104166666664 | 7.9 |
| 45001.114583333336 | 7.89 |
| 45001.125 | 7.89 |
| 45001.135416666664 | 7.88 |
| 45001.145833333336 | 7.88 |
| 45001.15625 | 7.88 |
| 45001.166666666664 | 7.88 |
| 45001.177083333336 | 7.88 |
| 45001.1875 | 7.87 |
| 45001.197916666664 | 7.86 |
| 45001.208333333336 | 7.86 |
| 45001.21875 | 7.85 |
| 45001.229166666664 | 7.86 |
| 45001.239583333336 | 7.86 |
| 45001.25 | 7.86 |
| 45001.260416666664 | 7.86 |
| 45001.270833333336 | 7.86 |
| 45001.28125 | 7.86 |
| 45001.291666666664 | 7.86 |
| 45001.302083333336 | 7.86 |
| 45001.3125 | 7.86 |
| 45001.322916666664 | 7.87 |
| 45001.333333333336 | 7.87 |
| 45001.34375 | 7.86 |
| 45001.354166666664 | 7.86 |
| 45001.364583333336 | 7.87 |
| 45001.375 | 7.86 |
| 45001.385416666664 | 7.86 |
| 45001.395833333336 | 7.86 |
| 45001.40625 | 7.85 |
| 45001.416666666664 | 7.85 |
| 45001.427083333336 | 7.85 |
| 45001.4375 | 7.84 |
| 45001.447916666664 | 7.84 |
| 45001.458333333336 | 7.83 |
| 45001.46875 | 7.83 |
| 45001.479166666664 | 7.82 |
| 45001.489583333336 | 7.82 |
| 45001.5 | 7.84 |
| 45001.510416666664 | 7.84 |
| 45001.520833333336 | 7.84 |
| 45001.53125 | 7.85 |
| 45001.541666666664 | 7.85 |
| 45001.552083333336 | 7.85 |
| 45001.5625 | 7.85 |
| 45001.572916666664 | 7.85 |
| 45001.583333333336 | 7.85 |
| 45001.59375 | 7.85 |
| 45001.604166666664 | 7.86 |
| 45001.614583333336 | 7.85 |
| 45001.625 | 7.86 |
| 45001.635416666664 | 7.85 |
| 45001.645833333336 | 7.85 |
| 45001.65625 | 7.85 |
| 45001.666666666664 | 7.85 |
| 45001.677083333336 | 7.86 |
| 45001.6875 | 7.86 |
| 45001.697916666664 | 7.86 |
| 45001.708333333336 | 7.87 |
| 45001.71875 | 7.88 |
| 45001.729166666664 | 7.88 |
| 45001.739583333336 | 7.88 |
| 45001.75 | 7.89 |
| 45001.760416666664 | 7.89 |
| 45001.770833333336 | 7.89 |
| 45001.78125 | 7.88 |
| 45001.791666666664 | 7.89 |
| 45001.802083333336 | 7.89 |
| 45001.8125 | 7.9 |
| 45001.822916666664 | 7.9 |
| 45001.833333333336 | 7.91 |
| 45001.84375 | 7.91 |
| 45001.854166666664 | 7.92 |
| 45001.864583333336 | 7.92 |
| 45001.875 | 7.91 |
| 45001.885416666664 | 7.92 |
| 45001.895833333336 | 7.92 |
| 45001.90625 | 7.92 |
| 45001.916666666664 | 7.92 |
| 45001.927083333336 | 7.92 |
| 45001.9375 | 7.92 |
| 45001.947916666664 | 7.92 |
| 45001.958333333336 | 7.92 |
| 45001.96875 | 7.92 |
| 45001.979166666664 | 7.92 |
| 45001.989583333336 | 7.91 |
| 45002.0 | 7.9 |
| 45002.010416666664 | 7.9 |
| 45002.020833333336 | 7.9 |
| 45002.03125 | 7.9 |
| 45002.041666666664 | 7.9 |
| 45002.052083333336 | 7.91 |
| 45002.0625 | 7.91 |
| 45002.072916666664 | 7.91 |
| 45002.083333333336 | 7.91 |
| 45002.09375 | 7.91 |
| 45002.104166666664 | 7.92 |
| 45002.114583333336 | 7.92 |
| 45002.125 | 7.9 |
| 45002.135416666664 | 7.9 |
| 45002.145833333336 | 7.9 |
| 45002.15625 | 7.9 |
| 45002.166666666664 | 7.9 |
| 45002.177083333336 | 7.89 |
| 45002.1875 | 7.89 |
| 45002.197916666664 | 7.88 |
| 45002.208333333336 | 7.88 |
| 45002.21875 | 7.87 |
| 45002.229166666664 | 7.87 |
| 45002.239583333336 | 7.87 |
| 45002.25 | 7.87 |
| 45002.260416666664 | 7.86 |
| 45002.270833333336 | 7.86 |
| 45002.28125 | 7.86 |
| 45002.291666666664 | 7.86 |
| 45002.302083333336 | 7.86 |
| 45002.3125 | 7.87 |
| 45002.322916666664 | 7.87 |
| 45002.333333333336 | 7.87 |
| 45002.34375 | 7.87 |
| 45002.354166666664 | 7.87 |
| 45002.364583333336 | 7.86 |
| 45002.375 | 7.87 |
| 45002.385416666664 | 7.86 |
| 45002.395833333336 | 7.87 |
| 45002.40625 | 7.86 |
| 45002.416666666664 | 7.86 |
| 45002.427083333336 | 7.87 |
| 45002.4375 | 7.86 |
| 45002.447916666664 | 7.86 |
| 45002.458333333336 | 7.86 |
| 45002.46875 | 7.85 |
| 45002.479166666664 | 7.84 |
| 45002.489583333336 | 7.84 |
| 45002.5 | 7.82 |
| 45002.510416666664 | 7.82 |
| 45002.520833333336 | 7.82 |
| 45002.53125 | 7.81 |
| 45002.541666666664 | 7.82 |
| 45002.552083333336 | 7.83 |
| 45002.5625 | 7.83 |
| 45002.572916666664 | 7.84 |
| 45002.583333333336 | 7.84 |
| 45002.59375 | 7.85 |
| 45002.604166666664 | 7.86 |
| 45002.614583333336 | 7.87 |
| 45002.625 | 7.87 |
| 45002.635416666664 | 7.87 |
| 45002.645833333336 | 7.88 |
| 45002.65625 | 7.88 |
| 45002.666666666664 | 7.88 |
| 45002.677083333336 | 7.88 |
| 45002.6875 | 7.88 |
| 45002.697916666664 | 7.87 |
| 45002.708333333336 | 7.87 |
| 45002.71875 | 7.87 |
| 45002.729166666664 | 7.86 |
| 45002.739583333336 | 7.87 |
| 45002.75 | 7.87 |
| 45002.760416666664 | 7.86 |
| 45002.770833333336 | 7.87 |
| 45002.78125 | 7.87 |
| 45002.791666666664 | 7.87 |
| 45002.802083333336 | 7.87 |
| 45002.8125 | 7.87 |
| 45002.822916666664 | 7.88 |
| 45002.833333333336 | 7.88 |
| 45002.84375 | 7.88 |
| 45002.854166666664 | 7.89 |
| 45002.864583333336 | 7.89 |
| 45002.875 | 7.89 |
| 45002.885416666664 | 7.89 |
| 45002.895833333336 | 7.89 |
| 45002.90625 | 7.89 |
| 45002.916666666664 | 7.89 |
| 45002.927083333336 | 7.89 |
| 45002.9375 | 7.89 |
| 45002.947916666664 | 7.9 |
| 45002.958333333336 | 7.89 |
| 45002.96875 | 7.89 |
| 45002.979166666664 | 7.89 |
| 45002.989583333336 | 7.89 |
| 45003.0 | 7.89 |
| 45003.010416666664 | 7.88 |
| 45003.020833333336 | 7.88 |
| 45003.03125 | 7.88 |
| 45003.041666666664 | 7.86 |
| 45003.052083333336 | 7.86 |
| 45003.0625 | 7.86 |
| 45003.072916666664 | 7.87 |
| 45003.083333333336 | 7.9 |
| 45003.09375 | 7.92 |
| 45003.104166666664 | 7.93 |
| 45003.114583333336 | 7.94 |
| 45003.125 | 7.95 |
| 45003.135416666664 | 7.95 |
| 45003.145833333336 | 7.95 |
| 45003.15625 | 7.95 |
| 45003.166666666664 | 7.96 |
| 45003.177083333336 | 7.94 |
| 45003.1875 | 7.93 |
| 45003.197916666664 | 7.93 |
| 45003.208333333336 | 7.92 |
| 45003.21875 | 7.91 |
| 45003.229166666664 | 7.9 |
| 45003.239583333336 | 7.88 |
| 45003.25 | 7.87 |
| 45003.260416666664 | 7.86 |
| 45003.270833333336 | 7.85 |
| 45003.28125 | 7.85 |
| 45003.291666666664 | 7.84 |
| 45003.302083333336 | 7.84 |
| 45003.3125 | 7.83 |
| 45003.322916666664 | 7.83 |
| 45003.333333333336 | 7.83 |
| 45003.34375 | 7.84 |
| 45003.354166666664 | 7.84 |
| 45003.364583333336 | 7.83 |
| 45003.375 | 7.83 |
| 45003.385416666664 | 7.83 |
| 45003.395833333336 | 7.83 |
| 45003.40625 | 7.83 |
| 45003.416666666664 | 7.83 |
| 45003.427083333336 | 7.83 |
| 45003.4375 | 7.83 |
| 45003.447916666664 | 7.83 |
| 45003.458333333336 | 7.83 |
| 45003.46875 | 7.82 |
| 45003.479166666664 | 7.83 |
| 45003.489583333336 | 7.83 |
| 45003.5 | 7.82 |
| 45003.510416666664 | 7.81 |
| 45003.520833333336 | 7.82 |
| 45003.53125 | 7.81 |
| 45003.541666666664 | 7.8 |
| 45003.552083333336 | 7.79 |
| 45003.5625 | 7.78 |
| 45003.572916666664 | 7.77 |
| 45003.583333333336 | 7.77 |
| 45003.59375 | 7.78 |
| 45003.604166666664 | 7.78 |
| 45003.614583333336 | 7.78 |
| 45003.625 | 7.79 |
| 45003.635416666664 | 7.81 |
| 45003.645833333336 | 7.82 |
| 45003.65625 | 7.85 |
| 45003.666666666664 | 7.85 |
| 45003.677083333336 | 7.87 |
| 45003.6875 | 7.88 |
| 45003.697916666664 | 7.89 |
| 45003.708333333336 | 7.89 |
| 45003.71875 | 7.88 |
| 45003.729166666664 | 7.88 |
| 45003.739583333336 | 7.87 |
| 45003.75 | 7.87 |
| 45003.760416666664 | 7.86 |
| 45003.770833333336 | 7.86 |
| 45003.78125 | 7.85 |
| 45003.791666666664 | 7.86 |
| 45003.802083333336 | 7.87 |
| 45003.8125 | 7.87 |
| 45003.822916666664 | 7.87 |
| 45003.833333333336 | 7.86 |
| 45003.84375 | 7.87 |
| 45003.854166666664 | 7.87 |
| 45003.864583333336 | 7.87 |
| 45003.875 | 7.88 |
| 45003.885416666664 | 7.88 |
| 45003.895833333336 | 7.88 |
| 45003.90625 | 7.88 |
| 45003.916666666664 | 7.88 |
| 45003.927083333336 | 7.88 |
| 45003.9375 | 7.88 |
| 45003.947916666664 | 7.88 |
| 45003.958333333336 | 7.88 |
| 45003.96875 | 7.88 |
| 45003.979166666664 | 7.88 |
| 45003.989583333336 | 7.88 |
| 45004.0 | 7.88 |
| 45004.010416666664 | 7.88 |
| 45004.020833333336 | 7.88 |
| 45004.03125 | 7.88 |
| 45004.041666666664 | 7.87 |
| 45004.052083333336 | 7.87 |
| 45004.0625 | 7.86 |
| 45004.072916666664 | 7.85 |
| 45004.083333333336 | 7.84 |
| 45004.09375 | 7.84 |
| 45004.104166666664 | 7.84 |
| 45004.114583333336 | 7.86 |
| 45004.125 | 7.86 |
| 45004.135416666664 | 7.87 |
| 45004.145833333336 | 7.9 |
| 45004.15625 | 7.9 |
| 45004.166666666664 | 7.91 |
| 45004.177083333336 | 7.91 |
| 45004.1875 | 7.91 |
| 45004.197916666664 | 7.91 |
| 45004.208333333336 | 7.91 |
| 45004.21875 | 7.91 |
| 45004.229166666664 | 7.9 |
| 45004.239583333336 | 7.89 |
| 45004.25 | 7.9 |
| 45004.260416666664 | 7.9 |
| 45004.270833333336 | 7.89 |
| 45004.28125 | 7.88 |
| 45004.291666666664 | 7.86 |
| 45004.302083333336 | 7.85 |
| 45004.3125 | 7.84 |
| 45004.322916666664 | 7.84 |
| 45004.333333333336 | 7.83 |
| 45004.34375 | 7.82 |
| 45004.354166666664 | 7.83 |
| 45004.364583333336 | 7.83 |
| 45004.375 | 7.82 |
| 45004.385416666664 | 7.83 |
| 45004.395833333336 | 7.83 |
| 45004.40625 | 7.83 |
| 45004.416666666664 | 7.83 |
| 45004.427083333336 | 7.83 |
| 45004.4375 | 7.83 |
| 45004.447916666664 | 7.83 |
| 45004.458333333336 | 7.83 |
| 45004.46875 | 7.83 |
| 45004.479166666664 | 7.83 |
| 45004.489583333336 | 7.83 |
| 45004.5 | 7.83 |
| 45004.510416666664 | 7.83 |
| 45004.520833333336 | 7.83 |
| 45004.53125 | 7.83 |
| 45004.541666666664 | 7.82 |
| 45004.552083333336 | 7.83 |
| 45004.5625 | 7.82 |
| 45004.572916666664 | 7.82 |
| 45004.583333333336 | 7.82 |
| 45004.59375 | 7.82 |
| 45004.604166666664 | 7.82 |
| 45004.614583333336 | 7.82 |
| 45004.625 | 7.82 |
| 45004.635416666664 | 7.83 |
| 45004.645833333336 | 7.83 |
| 45004.65625 | 7.84 |
| 45004.666666666664 | 7.84 |
| 45004.677083333336 | 7.85 |
| 45004.6875 | 7.86 |
| 45004.697916666664 | 7.87 |
| 45004.708333333336 | 7.88 |
| 45004.71875 | 7.89 |
| 45004.729166666664 | 7.9 |
| 45004.739583333336 | 7.91 |
| 45004.75 | 7.88 |
| 45004.760416666664 | 7.9 |
| 45004.770833333336 | 7.9 |
| 45004.78125 | 7.89 |
| 45004.791666666664 | 7.89 |
| 45004.802083333336 | 7.88 |
| 45004.8125 | 7.88 |
| 45004.822916666664 | 7.88 |
| 45004.833333333336 | 7.88 |
| 45004.84375 | 7.89 |
| 45004.854166666664 | 7.89 |
| 45004.864583333336 | 7.89 |
| 45004.875 | 7.89 |
| 45004.885416666664 | 7.89 |
| 45004.895833333336 | 7.89 |
| 45004.90625 | 7.89 |
| 45004.916666666664 | 7.88 |
| 45004.927083333336 | 7.88 |
| 45004.9375 | 7.88 |
| 45004.947916666664 | 7.88 |
| 45004.958333333336 | 7.88 |
| 45004.96875 | 7.88 |
| 45004.979166666664 | 7.87 |
| 45004.989583333336 | 7.88 |
| 45005.0 | 7.88 |
| 45005.010416666664 | 7.87 |
| 45005.020833333336 | 7.88 |
| 45005.03125 | 7.87 |
| 45005.041666666664 | 7.87 |
| 45005.052083333336 | 7.87 |
| 45005.0625 | 7.87 |
| 45005.072916666664 | 7.87 |
| 45005.083333333336 | 7.86 |
| 45005.09375 | 7.85 |
| 45005.104166666664 | 7.84 |
| 45005.114583333336 | 7.85 |
| 45005.125 | 7.85 |
| 45005.135416666664 | 7.86 |
| 45005.145833333336 | 7.85 |
| 45005.15625 | 7.87 |
| 45005.166666666664 | 7.87 |
| 45005.177083333336 | 7.89 |
| 45005.1875 | 7.91 |
| 45005.197916666664 | 7.91 |
| 45005.208333333336 | 7.92 |
| 45005.21875 | 7.91 |
| 45005.229166666664 | 7.91 |
| 45005.239583333336 | 7.9 |
| 45005.25 | 7.9 |
| 45005.260416666664 | 7.91 |
| 45005.270833333336 | 7.9 |
| 45005.28125 | 7.91 |
| 45005.291666666664 | 7.91 |
| 45005.302083333336 | 7.91 |
| 45005.3125 | 7.9 |
| 45005.322916666664 | 7.89 |
| 45005.333333333336 | 7.88 |
| 45005.34375 | 7.85 |
| 45005.354166666664 | 7.85 |
| 45005.364583333336 | 7.84 |
| 45005.375 | 7.83 |
| 45005.385416666664 | 7.83 |
| 45005.395833333336 | 7.83 |
| 45005.40625 | 7.83 |
| 45005.416666666664 | 7.83 |
| 45005.427083333336 | 7.84 |
| 45005.4375 | 7.84 |
| 45005.447916666664 | 7.84 |
| 45005.458333333336 | 7.84 |
| 45005.46875 | 7.84 |
| 45005.479166666664 | 7.84 |
| 45005.489583333336 | 7.84 |
| 45005.5 | 7.84 |
| 45005.510416666664 | 7.84 |
| 45005.520833333336 | 7.84 |
| 45005.53125 | 7.84 |
| 45005.541666666664 | 7.84 |
| 45005.552083333336 | 7.85 |
| 45005.5625 | 7.85 |
| 45005.572916666664 | 7.84 |
| 45005.583333333336 | 7.84 |
| 45005.59375 | 7.84 |
| 45005.604166666664 | 7.84 |
| 45005.614583333336 | 7.84 |
| 45005.625 | 7.84 |
| 45005.635416666664 | 7.84 |
| 45005.645833333336 | 7.84 |
| 45005.65625 | 7.85 |
| 45005.666666666664 | 7.85 |
| 45005.677083333336 | 7.85 |
| 45005.6875 | 7.86 |
| 45005.697916666664 | 7.87 |
| 45005.708333333336 | 7.87 |
| 45005.71875 | 7.88 |
| 45005.729166666664 | 7.88 |
| 45005.739583333336 | 7.88 |
| 45005.75 | 7.89 |
| 45005.760416666664 | 7.9 |
| 45005.770833333336 | 7.9 |
| 45005.78125 | 7.9 |
| 45005.791666666664 | 7.9 |
| 45005.802083333336 | 7.91 |
| 45005.8125 | 7.91 |
| 45005.822916666664 | 7.9 |
| 45005.833333333336 | 7.9 |
| 45005.84375 | 7.9 |
| 45005.854166666664 | 7.9 |
| 45005.864583333336 | 7.89 |
| 45005.875 | 7.9 |
| 45005.885416666664 | 7.89 |
| 45005.895833333336 | 7.9 |
| 45005.90625 | 7.9 |
| 45005.916666666664 | 7.89 |
| 45005.927083333336 | 7.9 |
| 45005.9375 | 7.89 |
| 45005.947916666664 | 7.89 |
| 45005.958333333336 | 7.89 |
| 45005.96875 | 7.89 |
| 45005.979166666664 | 7.88 |
| 45005.989583333336 | 7.88 |
| 45006.0 | 7.88 |
| 45006.010416666664 | 7.88 |
| 45006.020833333336 | 7.88 |
| 45006.03125 | 7.88 |
| 45006.041666666664 | 7.88 |
| 45006.052083333336 | 7.88 |
| 45006.0625 | 7.87 |
| 45006.072916666664 | 7.87 |
| 45006.083333333336 | 7.87 |
| 45006.09375 | 7.86 |
| 45006.104166666664 | 7.86 |
| 45006.114583333336 | 7.85 |
| 45006.125 | 7.84 |
| 45006.135416666664 | 7.83 |
| 45006.145833333336 | 7.83 |
| 45006.15625 | 7.83 |
| 45006.166666666664 | 7.84 |
| 45006.177083333336 | 7.84 |
| 45006.1875 | 7.84 |
| 45006.197916666664 | 7.86 |
| 45006.208333333336 | 7.87 |
| 45006.21875 | 7.86 |
| 45006.229166666664 | 7.88 |
| 45006.239583333336 | 7.87 |
| 45006.25 | 7.86 |
| 45006.260416666664 | 7.89 |
| 45006.270833333336 | 7.87 |
| 45006.28125 | 7.88 |
| 45006.291666666664 | 7.86 |
| 45006.302083333336 | 7.87 |
| 45006.3125 | 7.87 |
| 45006.322916666664 | 7.87 |
| 45006.333333333336 | 7.88 |
| 45006.34375 | 7.88 |
| 45006.354166666664 | 7.88 |
| 45006.364583333336 | 7.87 |
| 45006.375 | 7.86 |
| 45006.385416666664 | 7.85 |
| 45006.395833333336 | 7.83 |
| 45006.40625 | 7.82 |
| 45006.416666666664 | 7.81 |
| 45006.427083333336 | 7.81 |
| 45006.4375 | 7.81 |
| 45006.447916666664 | 7.82 |
| 45006.458333333336 | 7.82 |
| 45006.46875 | 7.82 |
| 45006.479166666664 | 7.83 |
| 45006.489583333336 | 7.83 |
| 45006.5 | 7.84 |
| 45006.510416666664 | 7.84 |
| 45006.520833333336 | 7.84 |
| 45006.53125 | 7.84 |
| 45006.541666666664 | 7.84 |
| 45006.552083333336 | 7.84 |
| 45006.5625 | 7.85 |
| 45006.572916666664 | 7.83 |
| 45006.583333333336 | 7.84 |
| 45006.59375 | 7.84 |
| 45006.604166666664 | 7.84 |
| 45006.614583333336 | 7.84 |
| 45006.625 | 7.84 |
| 45006.635416666664 | 7.84 |
| 45006.645833333336 | 7.84 |
| 45006.65625 | 7.84 |
| 45006.666666666664 | 7.84 |
| 45006.677083333336 | 7.84 |
| 45006.6875 | 7.84 |
| 45006.697916666664 | 7.84 |
| 45006.708333333336 | 7.85 |
| 45006.71875 | 7.86 |
| 45006.729166666664 | 7.86 |
| 45006.739583333336 | 7.87 |
| 45006.75 | 7.88 |
| 45006.760416666664 | 7.89 |
| 45006.770833333336 | 7.9 |
| 45006.78125 | 7.91 |
| 45006.791666666664 | 7.91 |
| 45006.802083333336 | 7.91 |
| 45006.8125 | 7.91 |
| 45006.822916666664 | 7.91 |
| 45006.833333333336 | 7.91 |
| 45006.84375 | 7.91 |
| 45006.854166666664 | 7.9 |
| 45006.864583333336 | 7.9 |
| 45006.875 | 7.9 |
| 45006.885416666664 | 7.9 |
| 45006.895833333336 | 7.9 |
| 45006.90625 | 7.9 |
| 45006.916666666664 | 7.9 |
| 45006.927083333336 | 7.9 |
| 45006.9375 | 7.9 |
| 45006.947916666664 | 7.89 |
| 45006.958333333336 | 7.89 |
| 45006.96875 | 7.89 |
| 45006.979166666664 | 7.88 |
| 45006.989583333336 | 7.88 |
| 45007.0 | 7.88 |
| 45007.010416666664 | 7.88 |
| 45007.020833333336 | 7.87 |
| 45007.03125 | 7.87 |
| 45007.041666666664 | 7.87 |
| 45007.052083333336 | 7.87 |
| 45007.0625 | 7.86 |
| 45007.072916666664 | 7.86 |
| 45007.083333333336 | 7.86 |
| 45007.09375 | 7.86 |
| 45007.104166666664 | 7.86 |
| 45007.114583333336 | 7.86 |
| 45007.125 | 7.85 |
| 45007.135416666664 | 7.85 |
| 45007.145833333336 | 7.84 |
| 45007.15625 | 7.84 |
| 45007.166666666664 | 7.83 |
| 45007.177083333336 | 7.82 |
| 45007.1875 | 7.82 |
| 45007.197916666664 | 7.83 |
| 45007.208333333336 | 7.83 |
| 45007.21875 | 7.83 |
| 45007.229166666664 | 7.84 |
| 45007.239583333336 | 7.84 |
| 45007.25 | 7.84 |
| 45007.260416666664 | 7.84 |
| 45007.270833333336 | 7.85 |
| 45007.28125 | 7.85 |
| 45007.291666666664 | 7.86 |
| 45007.302083333336 | 7.87 |
| 45007.3125 | 7.86 |
| 45007.322916666664 | 7.85 |
| 45007.333333333336 | 7.85 |
| 45007.34375 | 7.84 |
| 45007.354166666664 | 7.85 |
| 45007.364583333336 | 7.86 |
| 45007.375 | 7.86 |
| 45007.385416666664 | 7.85 |
| 45007.395833333336 | 7.84 |
| 45007.40625 | 7.84 |
| 45007.416666666664 | 7.82 |
| 45007.427083333336 | 7.81 |
| 45007.4375 | 7.8 |
| 45007.447916666664 | 7.79 |
| 45007.458333333336 | 7.79 |
| 45007.46875 | 7.79 |
| 45007.479166666664 | 7.8 |
| 45007.489583333336 | 7.8 |
| 45007.5 | 7.8 |
| 45007.510416666664 | 7.81 |
| 45007.520833333336 | 7.81 |
| 45007.53125 | 7.82 |
| 45007.541666666664 | 7.82 |
| 45007.552083333336 | 7.82 |
| 45007.5625 | 7.82 |
| 45007.572916666664 | 7.82 |
| 45007.583333333336 | 7.83 |
| 45007.59375 | 7.82 |
| 45007.604166666664 | 7.81 |
| 45007.614583333336 | 7.82 |
| 45007.625 | 7.82 |
| 45007.635416666664 | 7.83 |
| 45007.645833333336 | 7.82 |
| 45007.65625 | 7.83 |
| 45007.666666666664 | 7.82 |
| 45007.677083333336 | 7.82 |
| 45007.6875 | 7.82 |
| 45007.697916666664 | 7.82 |
| 45007.708333333336 | 7.82 |
| 45007.71875 | 7.82 |
| 45007.729166666664 | 7.82 |
| 45007.739583333336 | 7.82 |
| 45007.75 | 7.84 |
| 45007.760416666664 | 7.84 |
| 45007.770833333336 | 7.85 |
| 45007.78125 | 7.87 |
| 45007.791666666664 | 7.88 |
| 45007.802083333336 | 7.89 |
| 45007.8125 | 7.91 |
| 45007.822916666664 | 7.92 |
| 45007.833333333336 | 7.93 |
| 45007.84375 | 7.93 |
| 45007.854166666664 | 7.9 |
| 45007.864583333336 | 7.93 |
| 45007.875 | 7.93 |
| 45007.885416666664 | 7.91 |
| 45007.895833333336 | 7.9 |
| 45007.90625 | 7.89 |
| 45007.916666666664 | 7.9 |
| 45007.927083333336 | 7.89 |
| 45007.9375 | 7.89 |
| 45007.947916666664 | 7.89 |
| 45007.958333333336 | 7.88 |
| 45007.96875 | 7.88 |
| 45007.979166666664 | 7.88 |
| 45007.989583333336 | 7.86 |
| 45008.0 | 7.86 |
| 45008.010416666664 | 7.86 |
| 45008.020833333336 | 7.86 |
| 45008.03125 | 7.85 |
| 45008.041666666664 | 7.86 |
| 45008.052083333336 | 7.85 |
| 45008.0625 | 7.85 |
| 45008.072916666664 | 7.85 |
| 45008.083333333336 | 7.85 |
| 45008.09375 | 7.84 |
| 45008.104166666664 | 7.84 |
| 45008.114583333336 | 7.84 |
| 45008.125 | 7.84 |
| 45008.135416666664 | 7.84 |
| 45008.145833333336 | 7.84 |
| 45008.15625 | 7.84 |
| 45008.166666666664 | 7.83 |
| 45008.177083333336 | 7.82 |
| 45008.1875 | 7.82 |
| 45008.197916666664 | 7.81 |
| 45008.208333333336 | 7.8 |
| 45008.21875 | 7.79 |
| 45008.229166666664 | 7.77 |
| 45008.239583333336 | 7.77 |
| 45008.25 | 7.77 |
| 45008.260416666664 | 7.78 |
| 45008.270833333336 | 7.79 |
| 45008.28125 | 7.81 |
| 45008.291666666664 | 7.82 |
| 45008.302083333336 | 7.81 |
| 45008.3125 | 7.83 |
| 45008.322916666664 | 7.85 |
| 45008.333333333336 | 7.84 |
| 45008.34375 | 7.84 |
| 45008.354166666664 | 7.85 |
| 45008.364583333336 | 7.84 |
| 45008.375 | 7.84 |
| 45008.385416666664 | 7.83 |
| 45008.395833333336 | 7.84 |
| 45008.40625 | 7.83 |
| 45008.416666666664 | 7.82 |
| 45008.427083333336 | 7.81 |
| 45008.4375 | 7.8 |
| 45008.447916666664 | 7.8 |
| 45008.458333333336 | 7.79 |
| 45008.46875 | 7.78 |
| 45008.479166666664 | 7.78 |
| 45008.489583333336 | 7.77 |
| 45008.5 | 7.78 |
| 45008.510416666664 | 7.78 |
| 45008.520833333336 | 7.79 |
| 45008.53125 | 7.79 |
| 45008.541666666664 | 7.8 |
| 45008.552083333336 | 7.8 |
| 45008.5625 | 7.8 |
| 45008.572916666664 | 7.8 |
| 45008.583333333336 | 7.8 |
| 45008.59375 | 7.8 |
| 45008.604166666664 | 7.8 |
| 45008.614583333336 | 7.8 |
| 45008.625 | 7.8 |
| 45008.635416666664 | 7.81 |
| 45008.645833333336 | 7.8 |
| 45008.65625 | 7.81 |
| 45008.666666666664 | 7.82 |
| 45008.677083333336 | 7.82 |
| 45008.6875 | 7.83 |
| 45008.697916666664 | 7.83 |
| 45008.708333333336 | 7.83 |
| 45008.71875 | 7.83 |
| 45008.729166666664 | 7.83 |
| 45008.739583333336 | 7.84 |
| 45008.75 | 7.83 |
| 45008.760416666664 | 7.84 |
| 45008.770833333336 | 7.84 |
| 45008.78125 | 7.85 |
| 45008.791666666664 | 7.86 |
| 45008.802083333336 | 7.86 |
| 45008.8125 | 7.86 |
| 45008.822916666664 | 7.88 |
| 45008.833333333336 | 7.89 |
| 45008.84375 | 7.9 |
| 45008.854166666664 | 7.91 |
| 45008.864583333336 | 7.91 |
| 45008.875 | 7.92 |
| 45008.885416666664 | 7.9 |
| 45008.895833333336 | 7.89 |
| 45008.90625 | 7.88 |
| 45008.916666666664 | 7.87 |
| 45008.927083333336 | 7.88 |
| 45008.9375 | 7.88 |
| 45008.947916666664 | 7.88 |
| 45008.958333333336 | 7.88 |
| 45008.96875 | 7.88 |
| 45008.979166666664 | 7.88 |
| 45008.989583333336 | 7.87 |
| 45009.0 | 7.87 |
| 45009.010416666664 | 7.86 |
| 45009.020833333336 | 7.86 |
| 45009.03125 | 7.86 |
| 45009.041666666664 | 7.86 |
| 45009.052083333336 | 7.86 |
| 45009.0625 | 7.85 |
| 45009.072916666664 | 7.85 |
| 45009.083333333336 | 7.85 |
| 45009.09375 | 7.85 |
| 45009.104166666664 | 7.84 |
| 45009.114583333336 | 7.84 |
| 45009.125 | 7.83 |
| 45009.135416666664 | 7.83 |
| 45009.145833333336 | 7.83 |
| 45009.15625 | 7.83 |
| 45009.166666666664 | 7.83 |
| 45009.177083333336 | 7.83 |
| 45009.1875 | 7.83 |
| 45009.197916666664 | 7.82 |
| 45009.208333333336 | 7.81 |
| 45009.21875 | 7.8 |
| 45009.229166666664 | 7.8 |
| 45009.239583333336 | 7.78 |
| 45009.25 | 7.76 |
| 45009.260416666664 | 7.76 |
| 45009.270833333336 | 7.74 |
| 45009.28125 | 7.75 |
| 45009.291666666664 | 7.75 |
| 45009.302083333336 | 7.78 |
| 45009.3125 | 7.79 |
| 45009.322916666664 | 7.8 |
| 45009.333333333336 | 7.8 |
| 45009.34375 | 7.81 |
| 45009.354166666664 | 7.81 |
| 45009.364583333336 | 7.81 |
| 45009.375 | 7.8 |
| 45009.385416666664 | 7.8 |
| 45009.395833333336 | 7.8 |
| 45009.40625 | 7.79 |
| 45009.416666666664 | 7.79 |
| 45009.427083333336 | 7.78 |
| 45009.4375 | 7.79 |
| 45009.447916666664 | 7.77 |
| 45009.458333333336 | 7.78 |
| 45009.46875 | 7.77 |
| 45009.479166666664 | 7.77 |
| 45009.489583333336 | 7.76 |
| 45009.5 | 7.75 |
| 45009.510416666664 | 7.75 |
| 45009.520833333336 | 7.75 |
| 45009.53125 | 7.75 |
| 45009.541666666664 | 7.75 |
| 45009.552083333336 | 7.75 |
| 45009.5625 | 7.76 |
| 45009.572916666664 | 7.77 |
| 45009.583333333336 | 7.78 |
| 45009.59375 | 7.78 |
| 45009.604166666664 | 7.79 |
| 45009.614583333336 | 7.79 |
| 45009.625 | 7.78 |
| 45009.635416666664 | 7.79 |
| 45009.645833333336 | 7.79 |
| 45009.65625 | 7.79 |
| 45009.666666666664 | 7.79 |
| 45009.677083333336 | 7.8 |
| 45009.6875 | 7.81 |
| 45009.697916666664 | 7.81 |
| 45009.708333333336 | 7.81 |
| 45009.71875 | 7.81 |
| 45009.729166666664 | 7.81 |
| 45009.739583333336 | 7.82 |
| 45009.75 | 7.81 |
| 45009.760416666664 | 7.82 |
| 45009.770833333336 | 7.82 |
| 45009.78125 | 7.82 |
| 45009.791666666664 | 7.82 |
| 45009.802083333336 | 7.82 |
| 45009.8125 | 7.83 |
| 45009.822916666664 | 7.83 |
| 45009.833333333336 | 7.84 |
| 45009.84375 | 7.85 |
| 45009.854166666664 | 7.86 |
| 45009.864583333336 | 7.87 |
| 45009.875 | 7.88 |
| 45009.885416666664 | 7.88 |
| 45009.895833333336 | 7.89 |
| 45009.90625 | 7.89 |
| 45009.916666666664 | 7.88 |
| 45009.927083333336 | 7.88 |
| 45009.9375 | 7.88 |
| 45009.947916666664 | 7.88 |
| 45009.958333333336 | 7.87 |
| 45009.96875 | 7.87 |
| 45009.979166666664 | 7.86 |
| 45009.989583333336 | 7.86 |
| 45010.0 | 7.86 |
| 45010.010416666664 | 7.85 |
| 45010.020833333336 | 7.84 |
| 45010.03125 | 7.84 |
| 45010.041666666664 | 7.84 |
| 45010.052083333336 | 7.85 |
| 45010.0625 | 7.85 |
| 45010.072916666664 | 7.84 |
| 45010.083333333336 | 7.84 |
| 45010.09375 | 7.84 |
| 45010.104166666664 | 7.84 |
| 45010.114583333336 | 7.84 |
| 45010.125 | 7.84 |
| 45010.135416666664 | 7.83 |
| 45010.145833333336 | 7.84 |
| 45010.15625 | 7.83 |
| 45010.166666666664 | 7.83 |
| 45010.177083333336 | 7.83 |
| 45010.1875 | 7.82 |
| 45010.197916666664 | 7.82 |
| 45010.208333333336 | 7.82 |
| 45010.21875 | 7.82 |
| 45010.229166666664 | 7.82 |
| 45010.239583333336 | 7.81 |
| 45010.25 | 7.8 |
| 45010.260416666664 | 7.79 |
| 45010.270833333336 | 7.79 |
| 45010.28125 | 7.78 |
| 45010.291666666664 | 7.77 |
| 45010.302083333336 | 7.77 |
| 45010.3125 | 7.76 |
| 45010.322916666664 | 7.75 |
| 45010.333333333336 | 7.74 |
| 45010.34375 | 7.75 |
| 45010.354166666664 | 7.75 |
| 45010.364583333336 | 7.76 |
| 45010.375 | 7.76 |
| 45010.385416666664 | 7.76 |
| 45010.395833333336 | 7.75 |
| 45010.40625 | 7.76 |
| 45010.416666666664 | 7.75 |
| 45010.427083333336 | 7.75 |
| 45010.4375 | 7.75 |
| 45010.447916666664 | 7.75 |
| 45010.458333333336 | 7.75 |
| 45010.46875 | 7.74 |
| 45010.479166666664 | 7.74 |
| 45010.489583333336 | 7.75 |
| 45010.5 | 7.75 |
| 45010.510416666664 | 7.75 |
| 45010.520833333336 | 7.75 |
| 45010.53125 | 7.75 |
| 45010.541666666664 | 7.75 |
| 45010.552083333336 | 7.75 |
| 45010.5625 | 7.76 |
| 45010.572916666664 | 7.76 |
| 45010.583333333336 | 7.76 |
| 45010.59375 | 7.77 |
| 45010.604166666664 | 7.78 |
| 45010.614583333336 | 7.78 |
| 45010.625 | 7.78 |
| 45010.635416666664 | 7.79 |
| 45010.645833333336 | 7.8 |
| 45010.65625 | 7.81 |
| 45010.666666666664 | 7.81 |
| 45010.677083333336 | 7.81 |
| 45010.6875 | 7.81 |
| 45010.697916666664 | 7.78 |
| 45010.708333333336 | 7.8 |
| 45010.71875 | 7.81 |
| 45010.729166666664 | 7.82 |
| 45010.739583333336 | 7.81 |
| 45010.75 | 7.82 |
| 45010.760416666664 | 7.81 |
| 45010.770833333336 | 7.81 |
| 45010.78125 | 7.81 |
| 45010.791666666664 | 7.81 |
| 45010.802083333336 | 7.81 |
| 45010.8125 | 7.8 |
| 45010.822916666664 | 7.8 |
| 45010.833333333336 | 7.8 |
| 45010.84375 | 7.8 |
| 45010.854166666664 | 7.8 |
| 45010.864583333336 | 7.81 |
| 45010.875 | 7.81 |
| 45010.885416666664 | 7.81 |
| 45010.895833333336 | 7.81 |
| 45010.90625 | 7.81 |
| 45010.916666666664 | 7.81 |
| 45010.927083333336 | 7.81 |
| 45010.9375 | 7.81 |
| 45010.947916666664 | 7.8 |
| 45010.958333333336 | 7.8 |
| 45010.96875 | 7.79 |
| 45010.979166666664 | 7.8 |
| 45010.989583333336 | 7.81 |
| 45011.0 | 7.81 |
| 45011.010416666664 | 7.82 |
| 45011.020833333336 | 7.82 |
| 45011.03125 | 7.81 |
| 45011.041666666664 | 7.81 |
| 45011.052083333336 | 7.81 |
| 45011.0625 | 7.81 |
| 45011.072916666664 | 7.81 |
| 45011.083333333336 | 7.81 |
| 45011.09375 | 7.81 |
| 45011.104166666664 | 7.82 |
| 45011.114583333336 | 7.82 |
| 45011.125 | 7.81 |
| 45011.135416666664 | 7.82 |
| 45011.145833333336 | 7.82 |
| 45011.15625 | 7.82 |
| 45011.166666666664 | 7.82 |
| 45011.177083333336 | 7.82 |
| 45011.1875 | 7.82 |
| 45011.197916666664 | 7.82 |
| 45011.208333333336 | 7.82 |
| 45011.21875 | 7.81 |
| 45011.229166666664 | 7.81 |
| 45011.239583333336 | 7.81 |
| 45011.25 | 7.81 |
| 45011.260416666664 | 7.8 |
| 45011.270833333336 | 7.79 |
| 45011.28125 | 7.78 |
| 45011.291666666664 | 7.77 |
| 45011.302083333336 | 7.77 |
| 45011.3125 | 7.75 |
| 45011.322916666664 | 7.73 |
| 45011.333333333336 | 7.71 |
| 45011.34375 | 7.7 |
| 45011.354166666664 | 7.7 |
| 45011.364583333336 | 7.68 |
| 45011.375 | 7.68 |
| 45011.385416666664 | 7.7 |
| 45011.395833333336 | 7.7 |
| 45011.40625 | 7.7 |
| 45011.416666666664 | 7.71 |
| 45011.427083333336 | 7.72 |
| 45011.4375 | 7.72 |
| 45011.447916666664 | 7.72 |
| 45011.458333333336 | 7.72 |
| 45011.46875 | 7.71 |
| 45011.479166666664 | 7.71 |
| 45011.489583333336 | 7.71 |
| 45011.5 | 7.71 |
| 45011.510416666664 | 7.7 |
| 45011.520833333336 | 7.7 |
| 45011.53125 | 7.71 |
| 45011.541666666664 | 7.72 |
| 45011.552083333336 | 7.72 |
| 45011.5625 | 7.73 |
| 45011.572916666664 | 7.74 |
| 45011.583333333336 | 7.75 |
| 45011.59375 | 7.75 |
| 45011.604166666664 | 7.75 |
| 45011.614583333336 | 7.76 |
| 45011.625 | 7.77 |
| 45011.635416666664 | 7.77 |
| 45011.645833333336 | 7.78 |
| 45011.65625 | 7.78 |
| 45011.666666666664 | 7.79 |
| 45011.677083333336 | 7.8 |
| 45011.6875 | 7.8 |
| 45011.697916666664 | 7.81 |
| 45011.708333333336 | 7.82 |
| 45011.71875 | 7.81 |
| 45011.729166666664 | 7.82 |
| 45011.739583333336 | 7.82 |
| 45011.75 | 7.82 |
| 45011.760416666664 | 7.83 |
| 45011.770833333336 | 7.83 |
| 45011.78125 | 7.83 |
| 45011.791666666664 | 7.83 |
| 45011.802083333336 | 7.83 |
| 45011.8125 | 7.83 |
| 45011.822916666664 | 7.83 |
| 45011.833333333336 | 7.82 |
| 45011.84375 | 7.83 |
| 45011.854166666664 | 7.83 |
| 45011.864583333336 | 7.82 |
| 45011.875 | 7.82 |
| 45011.885416666664 | 7.82 |
| 45011.895833333336 | 7.82 |
| 45011.90625 | 7.83 |
| 45011.916666666664 | 7.81 |
| 45011.927083333336 | 7.82 |
| 45011.9375 | 7.8 |
| 45011.947916666664 | 7.8 |
| 45011.958333333336 | 7.8 |
| 45011.96875 | 7.8 |
| 45011.979166666664 | 7.8 |
| 45011.989583333336 | 7.79 |
| 45012.0 | 7.79 |
| 45012.010416666664 | 7.79 |
| 45012.020833333336 | 7.79 |
| 45012.03125 | 7.81 |
| 45012.041666666664 | 7.82 |
| 45012.052083333336 | 7.83 |
| 45012.0625 | 7.83 |
| 45012.072916666664 | 7.83 |
| 45012.083333333336 | 7.83 |
| 45012.09375 | 7.83 |
| 45012.104166666664 | 7.82 |
| 45012.114583333336 | 7.83 |
| 45012.125 | 7.82 |
| 45012.135416666664 | 7.83 |
| 45012.145833333336 | 7.83 |
| 45012.15625 | 7.83 |
| 45012.166666666664 | 7.83 |
| 45012.177083333336 | 7.83 |
| 45012.1875 | 7.83 |
| 45012.197916666664 | 7.83 |
| 45012.208333333336 | 7.83 |
| 45012.21875 | 7.83 |
| 45012.229166666664 | 7.83 |
| 45012.239583333336 | 7.82 |
| 45012.25 | 7.82 |
| 45012.260416666664 | 7.81 |
| 45012.270833333336 | 7.81 |
| 45012.28125 | 7.8 |
| 45012.291666666664 | 7.78 |
| 45012.302083333336 | 7.77 |
| 45012.3125 | 7.76 |
| 45012.322916666664 | 7.74 |
| 45012.333333333336 | 7.72 |
| 45012.34375 | 7.72 |
| 45012.354166666664 | 7.7 |
| 45012.364583333336 | 7.71 |
| 45012.375 | 7.72 |
| 45012.385416666664 | 7.74 |
| 45012.395833333336 | 7.73 |
| 45012.40625 | 7.73 |
| 45012.416666666664 | 7.73 |
| 45012.427083333336 | 7.73 |
| 45012.4375 | 7.73 |
| 45012.447916666664 | 7.72 |
| 45012.458333333336 | 7.72 |
| 45012.46875 | 7.72 |
| 45012.479166666664 | 7.71 |
| 45012.489583333336 | 7.71 |
| 45012.5 | 7.71 |
| 45012.510416666664 | 7.71 |
| 45012.520833333336 | 7.7 |
| 45012.53125 | 7.7 |
| 45012.541666666664 | 7.7 |
| 45012.552083333336 | 7.7 |
| 45012.5625 | 7.71 |
| 45012.572916666664 | 7.7 |
| 45012.583333333336 | 7.71 |
| 45012.59375 | 7.72 |
| 45012.604166666664 | 7.72 |
| 45012.614583333336 | 7.73 |
| 45012.625 | 7.73 |
| 45012.635416666664 | 7.74 |
| 45012.645833333336 | 7.74 |
| 45012.65625 | 7.74 |
| 45012.666666666664 | 7.75 |
| 45012.677083333336 | 7.74 |
| 45012.6875 | 7.76 |
| 45012.697916666664 | 7.77 |
| 45012.708333333336 | 7.77 |
| 45012.71875 | 7.77 |
| 45012.729166666664 | 7.77 |
| 45012.739583333336 | 7.76 |
| 45012.75 | 7.78 |
| 45012.760416666664 | 7.78 |
| 45012.770833333336 | 7.78 |
| 45012.78125 | 7.79 |
| 45012.791666666664 | 7.8 |
| 45012.802083333336 | 7.8 |
| 45012.8125 | 7.8 |
| 45012.822916666664 | 7.8 |
| 45012.833333333336 | 7.8 |
| 45012.84375 | 7.72 |
| 45012.854166666664 | 7.75 |
| 45012.864583333336 | 7.75 |
| 45012.875 | 7.77 |
| 45012.885416666664 | 7.78 |
| 45012.895833333336 | 7.79 |
| 45012.90625 | 7.79 |
| 45012.916666666664 | 7.8 |
| 45012.927083333336 | 7.8 |
| 45012.9375 | 7.8 |
| 45012.947916666664 | 7.8 |
| 45012.958333333336 | 7.8 |
| 45012.96875 | 7.8 |
| 45012.979166666664 | 7.8 |
| 45012.989583333336 | 7.81 |
| 45013.0 | 7.81 |
| 45013.010416666664 | 7.8 |
| 45013.020833333336 | 7.8 |
| 45013.03125 | 7.8 |
| 45013.041666666664 | 7.79 |
| 45013.052083333336 | 7.8 |
| 45013.0625 | 7.8 |
| 45013.072916666664 | 7.81 |
| 45013.083333333336 | 7.81 |
| 45013.09375 | 7.81 |
| 45013.104166666664 | 7.81 |
| 45013.114583333336 | 7.81 |
| 45013.125 | 7.82 |
| 45013.135416666664 | 7.82 |
| 45013.145833333336 | 7.82 |
| 45013.15625 | 7.82 |
| 45013.166666666664 | 7.82 |
| 45013.177083333336 | 7.82 |
| 45013.1875 | 7.82 |
| 45013.197916666664 | 7.83 |
| 45013.208333333336 | 7.82 |
| 45013.21875 | 7.83 |
| 45013.229166666664 | 7.83 |
| 45013.239583333336 | 7.83 |
| 45013.25 | 7.83 |
| 45013.260416666664 | 7.83 |
| 45013.270833333336 | 7.82 |
| 45013.28125 | 7.82 |
| 45013.291666666664 | 7.82 |
| 45013.302083333336 | 7.81 |
| 45013.3125 | 7.81 |
| 45013.322916666664 | 7.79 |
| 45013.333333333336 | 7.78 |
| 45013.34375 | 7.77 |
| 45013.354166666664 | 7.78 |
| 45013.364583333336 | 7.75 |
| 45013.375 | 7.73 |
| 45013.385416666664 | 7.72 |
| 45013.395833333336 | 7.71 |
| 45013.40625 | 7.71 |
| 45013.416666666664 | 7.73 |
| 45013.427083333336 | 7.74 |
| 45013.4375 | 7.74 |
| 45013.447916666664 | 7.76 |
| 45013.458333333336 | 7.74 |
| 45013.46875 | 7.75 |
| 45013.479166666664 | 7.74 |
| 45013.489583333336 | 7.75 |
| 45013.5 | 7.75 |
| 45013.510416666664 | 7.75 |
| 45013.520833333336 | 7.75 |
| 45013.53125 | 7.75 |
| 45013.541666666664 | 7.75 |
| 45013.552083333336 | 7.75 |
| 45013.5625 | 7.74 |
| 45013.572916666664 | 7.74 |
| 45013.583333333336 | 7.74 |
| 45013.59375 | 7.75 |
| 45013.604166666664 | 7.75 |
| 45013.614583333336 | 7.75 |
| 45013.625 | 7.76 |
| 45013.635416666664 | 7.77 |
| 45013.645833333336 | 7.78 |
| 45013.65625 | 7.79 |
| 45013.666666666664 | 7.79 |
| 45013.677083333336 | 7.79 |
| 45013.6875 | 7.8 |
| 45013.697916666664 | 7.8 |
| 45013.708333333336 | 7.81 |
| 45013.71875 | 7.82 |
| 45013.729166666664 | 7.82 |
| 45013.739583333336 | 7.83 |
| 45013.75 | 7.83 |
| 45013.760416666664 | 7.84 |
| 45013.770833333336 | 7.84 |
| 45013.78125 | 7.84 |
| 45013.791666666664 | 7.85 |
| 45013.802083333336 | 7.85 |
| 45013.8125 | 7.85 |
| 45013.822916666664 | 7.86 |
| 45013.833333333336 | 7.86 |
| 45013.84375 | 7.86 |
| 45013.854166666664 | 7.87 |
| 45013.864583333336 | 7.87 |
| 45013.875 | 7.87 |
| 45013.885416666664 | 7.87 |
| 45013.895833333336 | 7.88 |
| 45013.90625 | 7.88 |
| 45013.916666666664 | 7.88 |
| 45013.927083333336 | 7.88 |
| 45013.9375 | 7.88 |
| 45013.947916666664 | 7.88 |
| 45013.958333333336 | 7.88 |
| 45013.96875 | 7.88 |
| 45013.979166666664 | 7.88 |
| 45013.989583333336 | 7.87 |
| 45014.0 | 7.87 |
| 45014.010416666664 | 7.87 |
| 45014.020833333336 | 7.87 |
| 45014.03125 | 7.87 |
| 45014.041666666664 | 7.87 |
| 45014.052083333336 | 7.87 |
| 45014.0625 | 7.87 |
| 45014.072916666664 | 7.86 |
| 45014.083333333336 | 7.85 |
| 45014.09375 | 7.85 |
| 45014.104166666664 | 7.85 |
| 45014.114583333336 | 7.85 |
| 45014.125 | 7.85 |
| 45014.135416666664 | 7.85 |
| 45014.145833333336 | 7.85 |
| 45014.15625 | 7.85 |
| 45014.166666666664 | 7.85 |
| 45014.177083333336 | 7.85 |
| 45014.1875 | 7.85 |
| 45014.197916666664 | 7.85 |
| 45014.208333333336 | 7.85 |
| 45014.21875 | 7.85 |
| 45014.229166666664 | 7.85 |
| 45014.239583333336 | 7.84 |
| 45014.25 | 7.85 |
| 45014.260416666664 | 7.85 |
| 45014.270833333336 | 7.85 |
| 45014.28125 | 7.85 |
| 45014.291666666664 | 7.85 |
| 45014.302083333336 | 7.85 |
| 45014.3125 | 7.84 |
| 45014.322916666664 | 7.84 |
| 45014.333333333336 | 7.84 |
| 45014.34375 | 7.84 |
| 45014.354166666664 | 7.84 |
| 45014.364583333336 | 7.84 |
| 45014.375 | 7.83 |
| 45014.385416666664 | 7.82 |
| 45014.395833333336 | 7.83 |
| 45014.40625 | 7.81 |
| 45014.416666666664 | 7.81 |
| 45014.427083333336 | 7.8 |
| 45014.4375 | 7.78 |
| 45014.447916666664 | 7.75 |
| 45014.458333333336 | 7.75 |
| 45014.46875 | 7.75 |
| 45014.479166666664 | 7.73 |
| 45014.489583333336 | 7.74 |
| 45014.5 | 7.77 |
| 45014.510416666664 | 7.77 |
| 45014.520833333336 | 7.78 |
| 45014.53125 | 7.78 |
| 45014.541666666664 | 7.79 |
| 45014.552083333336 | 7.79 |
| 45014.5625 | 7.79 |
| 45014.572916666664 | 7.79 |
| 45014.583333333336 | 7.79 |
| 45014.59375 | 7.79 |
| 45014.604166666664 | 7.79 |
| 45014.614583333336 | 7.79 |
| 45014.625 | 7.79 |
| 45014.635416666664 | 7.79 |
| 45014.645833333336 | 7.79 |
| 45014.65625 | 7.8 |
| 45014.666666666664 | 7.8 |
| 45014.677083333336 | 7.81 |
| 45014.6875 | 7.82 |
| 45014.697916666664 | 7.83 |
| 45014.708333333336 | 7.84 |
| 45014.71875 | 7.85 |
| 45014.729166666664 | 7.85 |
| 45014.739583333336 | 7.86 |
| 45014.75 | 7.86 |
| 45014.760416666664 | 7.87 |
| 45014.770833333336 | 7.87 |
| 45014.78125 | 7.88 |
| 45014.791666666664 | 7.88 |
| 45014.802083333336 | 7.88 |
| 45014.8125 | 7.88 |
| 45014.822916666664 | 7.88 |
| 45014.833333333336 | 7.87 |
| 45014.84375 | 7.9 |
| 45014.854166666664 | 7.92 |
| 45014.864583333336 | 7.92 |
| 45014.875 | 7.93 |
| 45014.885416666664 | 7.93 |
| 45014.895833333336 | 7.93 |
| 45014.90625 | 7.93 |
| 45014.916666666664 | 7.93 |
| 45014.927083333336 | 7.92 |
| 45014.9375 | 7.92 |
| 45014.947916666664 | 7.92 |
| 45014.958333333336 | 7.92 |
| 45014.96875 | 7.91 |
| 45014.979166666664 | 7.91 |
| 45014.989583333336 | 7.91 |
| 45015.0 | 7.91 |
| 45015.010416666664 | 7.91 |
| 45015.020833333336 | 7.91 |
| 45015.03125 | 7.91 |
| 45015.041666666664 | 7.91 |
| 45015.052083333336 | 7.91 |
| 45015.0625 | 7.91 |
| 45015.072916666664 | 7.91 |
| 45015.083333333336 | 7.9 |
| 45015.09375 | 7.89 |
| 45015.104166666664 | 7.89 |
| 45015.114583333336 | 7.89 |
| 45015.125 | 7.88 |
| 45015.135416666664 | 7.88 |
| 45015.145833333336 | 7.88 |
| 45015.15625 | 7.89 |
| 45015.166666666664 | 7.88 |
| 45015.177083333336 | 7.88 |
| 45015.1875 | 7.87 |
| 45015.197916666664 | 7.88 |
| 45015.208333333336 | 7.88 |
| 45015.21875 | 7.89 |
| 45015.229166666664 | 7.88 |
| 45015.239583333336 | 7.87 |
| 45015.25 | 7.86 |
| 45015.260416666664 | 7.86 |
| 45015.270833333336 | 7.86 |
| 45015.28125 | 7.85 |
| 45015.291666666664 | 7.85 |
| 45015.302083333336 | 7.85 |
| 45015.3125 | 7.85 |
| 45015.322916666664 | 7.85 |
| 45015.333333333336 | 7.84 |
| 45015.34375 | 7.84 |
| 45015.354166666664 | 7.84 |
| 45015.364583333336 | 7.84 |
| 45015.375 | 7.84 |
| 45015.385416666664 | 7.83 |
| 45015.395833333336 | 7.83 |
| 45015.40625 | 7.82 |
| 45015.416666666664 | 7.82 |
| 45015.427083333336 | 7.82 |
| 45015.4375 | 7.82 |
| 45015.447916666664 | 7.82 |
| 45015.458333333336 | 7.81 |
| 45015.46875 | 7.81 |
| 45015.479166666664 | 7.8 |
| 45015.489583333336 | 7.81 |
| 45015.5 | 7.82 |
| 45015.510416666664 | 7.83 |
| 45015.520833333336 | 7.83 |
| 45015.53125 | 7.84 |
| 45015.541666666664 | 7.84 |
| 45015.552083333336 | 7.84 |
| 45015.5625 | 7.84 |
| 45015.572916666664 | 7.84 |
| 45015.583333333336 | 7.84 |
| 45015.59375 | 7.84 |
| 45015.604166666664 | 7.85 |
| 45015.614583333336 | 7.85 |
| 45015.625 | 7.85 |
| 45015.635416666664 | 7.84 |
| 45015.645833333336 | 7.84 |
| 45015.65625 | 7.84 |
| 45015.666666666664 | 7.84 |
| 45015.677083333336 | 7.85 |
| 45015.6875 | 7.85 |
| 45015.697916666664 | 7.85 |
| 45015.708333333336 | 7.86 |
| 45015.71875 | 7.86 |
| 45015.729166666664 | 7.87 |
| 45015.739583333336 | 7.88 |
| 45015.75 | 7.89 |
| 45015.760416666664 | 7.9 |
| 45015.770833333336 | 7.9 |
| 45015.78125 | 7.91 |
| 45015.791666666664 | 7.91 |
| 45015.802083333336 | 7.91 |
| 45015.8125 | 7.91 |
| 45015.822916666664 | 7.91 |
| 45015.833333333336 | 7.91 |
| 45015.84375 | 7.92 |
| 45015.854166666664 | 7.91 |
| 45015.864583333336 | 7.92 |
| 45015.875 | 7.93 |
| 45015.885416666664 | 7.92 |
| 45015.895833333336 | 7.92 |
| 45015.90625 | 7.93 |
| 45015.916666666664 | 7.93 |
| 45015.927083333336 | 7.93 |
| 45015.9375 | 7.95 |
| 45015.947916666664 | 7.95 |
| 45015.958333333336 | 7.95 |
| 45015.96875 | 7.96 |
| 45015.979166666664 | 7.95 |
| 45015.989583333336 | 7.95 |
| 45016.0 | 7.94 |
| 45016.010416666664 | 7.94 |
| 45016.020833333336 | 7.94 |
| 45016.03125 | 7.94 |
| 45016.041666666664 | 7.94 |
| 45016.052083333336 | 7.94 |
| 45016.0625 | 7.95 |
| 45016.072916666664 | 7.95 |
| 45016.083333333336 | 7.95 |
| 45016.09375 | 7.95 |
| 45016.104166666664 | 7.95 |
| 45016.114583333336 | 7.95 |
| 45016.125 | 7.95 |
| 45016.135416666664 | 7.95 |
| 45016.145833333336 | 7.94 |
| 45016.15625 | 7.93 |
| 45016.166666666664 | 7.93 |
| 45016.177083333336 | 7.92 |
| 45016.1875 | 7.92 |
| 45016.197916666664 | 7.92 |
| 45016.208333333336 | 7.91 |
| 45016.21875 | 7.9 |
| 45016.229166666664 | 7.9 |
| 45016.239583333336 | 7.89 |
| 45016.25 | 7.89 |
| 45016.260416666664 | 7.89 |
| 45016.270833333336 | 7.88 |
| 45016.28125 | 7.88 |
| 45016.291666666664 | 7.88 |
| 45016.302083333336 | 7.87 |
| 45016.3125 | 7.87 |
| 45016.322916666664 | 7.87 |
| 45016.333333333336 | 7.87 |
| 45016.34375 | 7.87 |
| 45016.354166666664 | 7.87 |
| 45016.364583333336 | 7.87 |
| 45016.375 | 7.87 |
| 45016.385416666664 | 7.86 |
| 45016.395833333336 | 7.86 |
| 45016.40625 | 7.85 |
| 45016.416666666664 | 7.86 |
| 45016.427083333336 | 7.86 |
| 45016.4375 | 7.86 |
| 45016.447916666664 | 7.86 |
| 45016.458333333336 | 7.85 |
| 45016.46875 | 7.85 |
| 45016.479166666664 | 7.85 |
| 45016.489583333336 | 7.84 |
| 45016.5 | 7.83 |
| 45016.510416666664 | 7.84 |
| 45016.520833333336 | 7.85 |
| 45016.53125 | 7.86 |
| 45016.541666666664 | 7.87 |
| 45016.552083333336 | 7.87 |
| 45016.5625 | 7.87 |
| 45016.572916666664 | 7.87 |
| 45016.583333333336 | 7.88 |
| 45016.59375 | 7.88 |
| 45016.604166666664 | 7.88 |
| 45016.614583333336 | 7.88 |
| 45016.625 | 7.88 |
| 45016.635416666664 | 7.88 |
| 45016.645833333336 | 7.89 |
| 45016.65625 | 7.89 |
| 45016.666666666664 | 7.89 |
| 45016.677083333336 | 7.89 |
| 45016.6875 | 7.88 |
| 45016.697916666664 | 7.88 |
| 45016.708333333336 | 7.88 |
| 45016.71875 | 7.88 |
| 45016.729166666664 | 7.88 |
| 45016.739583333336 | 7.88 |
| 45016.75 | 7.88 |
| 45016.760416666664 | 7.89 |
| 45016.770833333336 | 7.9 |
| 45016.78125 | 7.9 |
| 45016.791666666664 | 7.9 |
| 45016.802083333336 | 7.9 |
| 45016.8125 | 7.89 |
| 45016.822916666664 | 7.89 |
| 45016.833333333336 | 7.89 |
| 45016.84375 | 7.89 |
| 45016.854166666664 | 7.89 |
| 45016.864583333336 | 7.9 |
| 45016.875 | 7.9 |
| 45016.885416666664 | 7.9 |
| 45016.895833333336 | 7.9 |
| 45016.90625 | 7.91 |
| 45016.916666666664 | 7.9 |
| 45016.927083333336 | 7.9 |
| 45016.9375 | 7.9 |
| 45016.947916666664 | 7.91 |
| 45016.958333333336 | 7.91 |
| 45016.96875 | 7.91 |
| 45016.979166666664 | 7.91 |
| 45016.989583333336 | 7.91 |
| 45017.0 | 7.9 |
| 45017.010416666664 | 7.9 |
| 45017.020833333336 | 7.89 |
| 45017.03125 | 7.89 |
| 45017.041666666664 | 7.9 |
| 45017.052083333336 | 7.91 |
| 45017.0625 | 7.91 |
| 45017.072916666664 | 7.92 |
| 45017.083333333336 | 7.92 |
| 45017.09375 | 7.92 |
| 45017.104166666664 | 7.92 |
| 45017.114583333336 | 7.92 |
| 45017.125 | 7.92 |
| 45017.135416666664 | 7.92 |
| 45017.145833333336 | 7.91 |